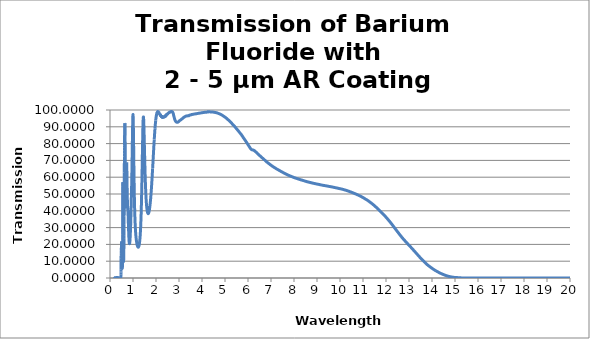
| Category | Series 0 |
|---|---|
| 20.0057 | 0 |
| 19.9979 | 0 |
| 19.9902 | 0 |
| 19.9825 | 0 |
| 19.9748 | 0 |
| 19.9671 | 0 |
| 19.9593 | 0 |
| 19.9516 | 0 |
| 19.943900000000003 | 0 |
| 19.9362 | 0 |
| 19.9284 | 0 |
| 19.9207 | 0 |
| 19.913 | 0 |
| 19.9053 | 0 |
| 19.897599999999997 | 0 |
| 19.8898 | 0 |
| 19.882099999999998 | 0 |
| 19.8744 | 0 |
| 19.8667 | 0 |
| 19.859 | 0 |
| 19.851200000000002 | 0 |
| 19.8435 | 0 |
| 19.8358 | 0 |
| 19.8281 | 0 |
| 19.8203 | 0 |
| 19.8126 | 0 |
| 19.8049 | 0 |
| 19.7972 | 0 |
| 19.7895 | 0 |
| 19.7817 | 0 |
| 19.774 | 0 |
| 19.766299999999998 | 0 |
| 19.758599999999998 | 0 |
| 19.7509 | 0 |
| 19.7431 | 0 |
| 19.735400000000002 | 0 |
| 19.727700000000002 | 0 |
| 19.72 | 0 |
| 19.7123 | 0 |
| 19.7045 | 0 |
| 19.6968 | 0 |
| 19.6891 | 0 |
| 19.6814 | 0 |
| 19.673599999999997 | 0 |
| 19.6659 | 0 |
| 19.6582 | 0 |
| 19.6505 | 0 |
| 19.642799999999998 | 0 |
| 19.635 | 0 |
| 19.627299999999998 | 0 |
| 19.6196 | 0 |
| 19.611900000000002 | 0 |
| 19.604200000000002 | 0 |
| 19.596400000000003 | 0 |
| 19.5887 | 0 |
| 19.581 | 0 |
| 19.5733 | 0 |
| 19.5655 | 0 |
| 19.5578 | 0 |
| 19.550099999999997 | 0 |
| 19.5424 | 0 |
| 19.5347 | 0 |
| 19.5269 | 0 |
| 19.5192 | 0 |
| 19.5115 | 0 |
| 19.5038 | 0 |
| 19.4961 | 0 |
| 19.4883 | 0 |
| 19.4806 | 0 |
| 19.472900000000003 | 0 |
| 19.4652 | 0 |
| 19.4575 | 0 |
| 19.4497 | 0 |
| 19.442 | 0 |
| 19.4343 | 0 |
| 19.426599999999997 | 0 |
| 19.4188 | 0 |
| 19.411099999999998 | 0 |
| 19.4034 | 0 |
| 19.3957 | 0 |
| 19.388 | 0 |
| 19.380200000000002 | 0 |
| 19.3725 | 0 |
| 19.3648 | 0 |
| 19.3571 | 0 |
| 19.349400000000003 | 0 |
| 19.3416 | 0 |
| 19.3339 | 0 |
| 19.3262 | 0 |
| 19.3185 | 0 |
| 19.3107 | 0 |
| 19.303 | 0 |
| 19.2953 | 0 |
| 19.287599999999998 | 0 |
| 19.2799 | 0 |
| 19.2721 | 0 |
| 19.264400000000002 | 0 |
| 19.256700000000002 | 0 |
| 19.249 | 0 |
| 19.2413 | 0 |
| 19.2335 | 0 |
| 19.2258 | 0 |
| 19.2181 | 0 |
| 19.2104 | 0 |
| 19.2027 | 0 |
| 19.1949 | 0 |
| 19.1872 | 0 |
| 19.1795 | 0 |
| 19.171799999999998 | 0 |
| 19.164 | 0 |
| 19.156299999999998 | 0 |
| 19.1486 | 0 |
| 19.140900000000002 | 0 |
| 19.133200000000002 | 0 |
| 19.125400000000003 | 0 |
| 19.1177 | 0 |
| 19.11 | 0 |
| 19.1023 | 0 |
| 19.0946 | 0 |
| 19.0868 | 0 |
| 19.079099999999997 | 0 |
| 19.0714 | 0 |
| 19.0637 | 0 |
| 19.0559 | 0 |
| 19.0482 | 0 |
| 19.0405 | 0 |
| 19.032799999999998 | 0 |
| 19.0251 | 0 |
| 19.0173 | 0 |
| 19.0096 | 0 |
| 19.001900000000003 | 0 |
| 18.9942 | 0 |
| 18.9865 | 0 |
| 18.9787 | 0 |
| 18.971 | 0 |
| 18.9633 | 0 |
| 18.955599999999997 | 0 |
| 18.9479 | 0 |
| 18.940099999999997 | 0 |
| 18.9324 | 0 |
| 18.9247 | 0 |
| 18.917 | 0 |
| 18.909200000000002 | 0 |
| 18.9015 | 0 |
| 18.8938 | 0 |
| 18.8861 | 0 |
| 18.878400000000003 | 0 |
| 18.8706 | 0 |
| 18.8629 | 0 |
| 18.8552 | 0 |
| 18.8475 | 0 |
| 18.8398 | 0 |
| 18.832 | 0 |
| 18.8243 | 0 |
| 18.816599999999998 | 0 |
| 18.8089 | 0 |
| 18.801099999999998 | 0 |
| 18.793400000000002 | 0 |
| 18.785700000000002 | 0 |
| 18.778 | 0 |
| 18.7703 | 0 |
| 18.7625 | 0 |
| 18.7548 | 0 |
| 18.7471 | 0 |
| 18.7394 | 0 |
| 18.7317 | 0 |
| 18.7239 | 0 |
| 18.7162 | 0 |
| 18.7085 | 0 |
| 18.7008 | 0 |
| 18.693099999999998 | 0 |
| 18.685299999999998 | 0 |
| 18.677599999999998 | 0 |
| 18.669900000000002 | 0 |
| 18.662200000000002 | 0 |
| 18.654400000000003 | 0 |
| 18.6467 | 0 |
| 18.639 | 0 |
| 18.6313 | 0 |
| 18.6236 | 0 |
| 18.6158 | 0 |
| 18.6081 | 0 |
| 18.6004 | 0 |
| 18.5927 | 0 |
| 18.585 | 0 |
| 18.5772 | 0 |
| 18.5695 | 0 |
| 18.561799999999998 | 0 |
| 18.5541 | 0 |
| 18.5463 | 0 |
| 18.5386 | 0 |
| 18.530900000000003 | 0 |
| 18.5232 | 0 |
| 18.5155 | 0 |
| 18.5077 | 0 |
| 18.5 | 0 |
| 18.4923 | 0 |
| 18.484599999999997 | 0 |
| 18.4769 | 0 |
| 18.469099999999997 | 0 |
| 18.4614 | 0 |
| 18.4537 | 0 |
| 18.446 | 0 |
| 18.438299999999998 | 0 |
| 18.4305 | 0 |
| 18.4228 | 0 |
| 18.4151 | 0 |
| 18.407400000000003 | 0 |
| 18.3996 | 0 |
| 18.3919 | 0 |
| 18.3842 | 0 |
| 18.3765 | 0 |
| 18.3688 | 0 |
| 18.361 | 0 |
| 18.3533 | 0 |
| 18.345599999999997 | 0 |
| 18.3379 | 0 |
| 18.3302 | 0 |
| 18.322400000000002 | 0 |
| 18.314700000000002 | 0 |
| 18.307 | 0 |
| 18.2993 | 0 |
| 18.2915 | 0 |
| 18.2838 | 0 |
| 18.2761 | 0 |
| 18.2684 | 0 |
| 18.2607 | 0 |
| 18.2529 | 0 |
| 18.2452 | 0 |
| 18.2375 | 0 |
| 18.2298 | 0 |
| 18.222099999999998 | 0 |
| 18.214299999999998 | 0 |
| 18.206599999999998 | 0 |
| 18.198900000000002 | 0 |
| 18.191200000000002 | 0 |
| 18.1835 | 0 |
| 18.1757 | 0 |
| 18.168 | 0 |
| 18.1603 | 0 |
| 18.1526 | 0 |
| 18.1448 | 0 |
| 18.1371 | 0 |
| 18.1294 | 0 |
| 18.1217 | 0 |
| 18.114 | 0 |
| 18.1062 | 0 |
| 18.0985 | 0 |
| 18.090799999999998 | 0 |
| 18.083099999999998 | 0 |
| 18.075400000000002 | 0 |
| 18.0676 | 0 |
| 18.059900000000003 | 0 |
| 18.0522 | 0 |
| 18.0445 | 0 |
| 18.0367 | 0 |
| 18.029 | 0 |
| 18.0213 | 0 |
| 18.0136 | 0 |
| 18.0059 | 0 |
| 17.998099999999997 | 0 |
| 17.9904 | 0 |
| 17.9827 | 0 |
| 17.975 | 0 |
| 17.967299999999998 | 0 |
| 17.9595 | 0 |
| 17.9518 | 0 |
| 17.9441 | 0 |
| 17.936400000000003 | 0 |
| 17.9287 | 0 |
| 17.920900000000003 | 0 |
| 17.9132 | 0 |
| 17.9055 | 0 |
| 17.8978 | 0 |
| 17.89 | 0 |
| 17.8823 | 0 |
| 17.874599999999997 | 0 |
| 17.8669 | 0 |
| 17.8592 | 0 |
| 17.8514 | 0 |
| 17.843700000000002 | 0 |
| 17.836 | 0 |
| 17.8283 | 0 |
| 17.8206 | 0 |
| 17.8128 | 0 |
| 17.8051 | 0 |
| 17.797400000000003 | 0 |
| 17.7897 | 0 |
| 17.7819 | 0 |
| 17.7742 | 0 |
| 17.7665 | 0 |
| 17.7588 | 0 |
| 17.751099999999997 | 0 |
| 17.743299999999998 | 0 |
| 17.735599999999998 | 0 |
| 17.7279 | 0 |
| 17.720200000000002 | 0 |
| 17.7125 | 0 |
| 17.7047 | 0 |
| 17.697 | 0 |
| 17.6893 | 0 |
| 17.6816 | 0 |
| 17.6739 | 0 |
| 17.6661 | 0 |
| 17.6584 | 0 |
| 17.6507 | 0 |
| 17.643 | 0 |
| 17.6352 | 0 |
| 17.6275 | 0 |
| 17.619799999999998 | 0 |
| 17.612099999999998 | 0 |
| 17.604400000000002 | 0 |
| 17.5966 | 0 |
| 17.588900000000002 | 0 |
| 17.5812 | 0 |
| 17.5735 | 0 |
| 17.5658 | 0 |
| 17.558 | 0 |
| 17.5503 | 0 |
| 17.5426 | 0 |
| 17.5349 | 0 |
| 17.527099999999997 | 0 |
| 17.5194 | 0 |
| 17.5117 | 0 |
| 17.504 | 0 |
| 17.496299999999998 | 0 |
| 17.4885 | 0 |
| 17.4808 | 0 |
| 17.4731 | 0 |
| 17.465400000000002 | 0 |
| 17.4577 | 0 |
| 17.449900000000003 | 0 |
| 17.4422 | 0 |
| 17.4345 | 0 |
| 17.4268 | 0 |
| 17.4191 | 0 |
| 17.4113 | 0 |
| 17.403599999999997 | 0 |
| 17.3959 | 0 |
| 17.3882 | 0 |
| 17.3804 | 0 |
| 17.372700000000002 | 0 |
| 17.365 | 0 |
| 17.3573 | 0 |
| 17.3496 | 0 |
| 17.3418 | 0 |
| 17.3341 | 0 |
| 17.326400000000003 | 0 |
| 17.3187 | 0 |
| 17.311 | 0 |
| 17.3032 | 0 |
| 17.2955 | 0 |
| 17.2878 | 0 |
| 17.280099999999997 | 0 |
| 17.2724 | 0 |
| 17.264599999999998 | 0 |
| 17.2569 | 0 |
| 17.249200000000002 | 0 |
| 17.2415 | 0 |
| 17.233700000000002 | 0 |
| 17.226 | 0 |
| 17.2183 | 0 |
| 17.2106 | 0 |
| 17.202900000000003 | 0 |
| 17.1951 | 0 |
| 17.1874 | 0 |
| 17.1797 | 0 |
| 17.172 | 0 |
| 17.1643 | 0 |
| 17.1565 | 0 |
| 17.148799999999998 | 0 |
| 17.141099999999998 | 0 |
| 17.1334 | 0 |
| 17.1256 | 0 |
| 17.117900000000002 | 0 |
| 17.1102 | 0 |
| 17.1025 | 0 |
| 17.0948 | 0 |
| 17.087 | 0 |
| 17.0793 | 0 |
| 17.0716 | 0 |
| 17.0639 | 0 |
| 17.0562 | 0 |
| 17.0484 | 0 |
| 17.0407 | 0 |
| 17.033 | 0 |
| 17.025299999999998 | 0 |
| 17.017599999999998 | 0 |
| 17.0098 | 0 |
| 17.0021 | 0 |
| 16.994400000000002 | 0 |
| 16.9867 | 0 |
| 16.978900000000003 | 0 |
| 16.9712 | 0 |
| 16.9635 | 0 |
| 16.9558 | 0 |
| 16.9481 | 0 |
| 16.9403 | 0 |
| 16.932599999999997 | 0 |
| 16.9249 | 0 |
| 16.9172 | 0 |
| 16.9095 | 0 |
| 16.9017 | 0 |
| 16.894 | 0 |
| 16.8863 | 0 |
| 16.8786 | 0 |
| 16.8708 | 0 |
| 16.8631 | 0 |
| 16.855400000000003 | 0 |
| 16.8477 | 0 |
| 16.84 | 0 |
| 16.8322 | 0 |
| 16.8245 | 0 |
| 16.8168 | 0 |
| 16.809099999999997 | 0 |
| 16.8014 | 0 |
| 16.793599999999998 | 0 |
| 16.7859 | 0 |
| 16.778200000000002 | 0 |
| 16.7705 | 0 |
| 16.7628 | 0 |
| 16.755 | 0 |
| 16.7473 | 0 |
| 16.7396 | 0 |
| 16.731900000000003 | 0 |
| 16.7241 | 0 |
| 16.7164 | 0 |
| 16.7087 | 0 |
| 16.701 | 0 |
| 16.6933 | 0 |
| 16.6855 | 0 |
| 16.677799999999998 | 0 |
| 16.670099999999998 | 0 |
| 16.6624 | 0 |
| 16.654700000000002 | 0 |
| 16.646900000000002 | 0 |
| 16.639200000000002 | 0 |
| 16.6315 | 0 |
| 16.6238 | 0 |
| 16.616 | 0 |
| 16.6083 | 0 |
| 16.6006 | 0 |
| 16.5929 | 0 |
| 16.5852 | 0 |
| 16.5774 | 0 |
| 16.5697 | 0 |
| 16.562 | 0 |
| 16.554299999999998 | 0 |
| 16.546599999999998 | 0 |
| 16.5388 | 0 |
| 16.5311 | 0 |
| 16.523400000000002 | 0 |
| 16.515700000000002 | 0 |
| 16.508 | 0 |
| 16.5002 | 0 |
| 16.4925 | 0 |
| 16.4848 | 0 |
| 16.4771 | 0 |
| 16.4693 | 0 |
| 16.461599999999997 | 0 |
| 16.4539 | 0 |
| 16.4462 | 0 |
| 16.4385 | 0 |
| 16.4307 | 0 |
| 16.423 | 0 |
| 16.4153 | 0 |
| 16.4076 | 0 |
| 16.399900000000002 | 0 |
| 16.3921 | 0 |
| 16.384400000000003 | 0 |
| 16.3767 | 0 |
| 16.369 | 0 |
| 16.3612 | 0 |
| 16.3535 | 0 |
| 16.3458 | 0 |
| 16.3381 | 0 |
| 16.3304 | 0 |
| 16.3226 | 0 |
| 16.314899999999998 | 0 |
| 16.3072 | 0 |
| 16.2995 | 0 |
| 16.2918 | 0 |
| 16.284 | 0 |
| 16.2763 | 0 |
| 16.2686 | 0 |
| 16.2609 | 0 |
| 16.2532 | 0 |
| 16.2454 | 0 |
| 16.2377 | 0 |
| 16.23 | 0 |
| 16.2223 | 0 |
| 16.2145 | 0 |
| 16.206799999999998 | 0 |
| 16.1991 | 0 |
| 16.191399999999998 | 0 |
| 16.1837 | 0 |
| 16.1759 | 0 |
| 16.168200000000002 | 0 |
| 16.1605 | 0 |
| 16.1528 | 0 |
| 16.1451 | 0 |
| 16.1373 | 0 |
| 16.1296 | 0 |
| 16.1219 | 0 |
| 16.1142 | 0 |
| 16.1064 | 0 |
| 16.0987 | 0 |
| 16.091 | 0 |
| 16.083299999999998 | 0 |
| 16.0756 | 0 |
| 16.0678 | 0 |
| 16.060100000000002 | 0 |
| 16.0524 | 0 |
| 16.044700000000002 | 0 |
| 16.037 | 0 |
| 16.0292 | 0 |
| 16.0215 | 0 |
| 16.0138 | 0 |
| 16.0061 | 0 |
| 15.9984 | 0 |
| 15.9906 | 0 |
| 15.982899999999999 | 0 |
| 15.975200000000001 | 0 |
| 15.9675 | 0 |
| 15.959700000000002 | 0 |
| 15.952 | 0 |
| 15.9443 | 0 |
| 15.9366 | 0 |
| 15.9289 | 0 |
| 15.921100000000001 | 0 |
| 15.9134 | 0 |
| 15.905700000000001 | 0 |
| 15.898 | 0 |
| 15.8903 | 0 |
| 15.8825 | 0 |
| 15.874799999999999 | 0 |
| 15.8671 | 0 |
| 15.859399999999999 | 0 |
| 15.851600000000001 | 0 |
| 15.8439 | 0 |
| 15.836200000000002 | 0 |
| 15.8285 | 0 |
| 15.820799999999998 | 0 |
| 15.813 | 0 |
| 15.805299999999999 | 0 |
| 15.797600000000001 | 0 |
| 15.7899 | 0 |
| 15.782200000000001 | 0 |
| 15.7744 | 0 |
| 15.7667 | 0 |
| 15.759 | 0 |
| 15.751299999999999 | 0 |
| 15.7436 | 0 |
| 15.7358 | 0 |
| 15.7281 | 0 |
| 15.7204 | 0 |
| 15.7127 | 0 |
| 15.7049 | 0 |
| 15.6972 | 0 |
| 15.6895 | 0 |
| 15.681799999999999 | 0 |
| 15.674100000000001 | 0 |
| 15.6663 | 0 |
| 15.6586 | 0 |
| 15.6509 | 0 |
| 15.6432 | 0 |
| 15.6355 | 0 |
| 15.6277 | 0 |
| 15.62 | 0 |
| 15.6123 | 0 |
| 15.6046 | 0 |
| 15.5968 | 0 |
| 15.5891 | 0 |
| 15.5814 | 0 |
| 15.5737 | 0 |
| 15.566 | 0 |
| 15.558200000000001 | 0 |
| 15.5505 | 0 |
| 15.5428 | 0 |
| 15.5351 | 0 |
| 15.5274 | 0 |
| 15.5196 | 0 |
| 15.511899999999999 | 0 |
| 15.5042 | 0 |
| 15.4965 | 0 |
| 15.4888 | 0 |
| 15.481 | 0 |
| 15.4733 | 0 |
| 15.4656 | 0 |
| 15.4579 | 0 |
| 15.4501 | 0 |
| 15.4424 | 0 |
| 15.434700000000001 | 0 |
| 15.427 | 0 |
| 15.4193 | 0 |
| 15.4115 | 0 |
| 15.403799999999999 | 0 |
| 15.3961 | 0 |
| 15.388399999999999 | 0 |
| 15.380700000000001 | 0.001 |
| 15.3729 | 0.002 |
| 15.365200000000002 | 0.003 |
| 15.3575 | 0.004 |
| 15.3498 | 0.005 |
| 15.342 | 0.006 |
| 15.334299999999999 | 0.013 |
| 15.326600000000001 | 0.02 |
| 15.3189 | 0.027 |
| 15.311200000000001 | 0.033 |
| 15.3034 | 0.04 |
| 15.2957 | 0.047 |
| 15.288 | 0.054 |
| 15.280299999999999 | 0.061 |
| 15.2726 | 0.067 |
| 15.2648 | 0.074 |
| 15.257100000000001 | 0.081 |
| 15.2494 | 0.088 |
| 15.241700000000002 | 0.095 |
| 15.234 | 0.101 |
| 15.2262 | 0.108 |
| 15.2185 | 0.115 |
| 15.210799999999999 | 0.121 |
| 15.203100000000001 | 0.129 |
| 15.1953 | 0.136 |
| 15.1876 | 0.143 |
| 15.1799 | 0.151 |
| 15.1722 | 0.158 |
| 15.1645 | 0.166 |
| 15.1567 | 0.174 |
| 15.149 | 0.183 |
| 15.1413 | 0.191 |
| 15.1336 | 0.2 |
| 15.1259 | 0.208 |
| 15.1181 | 0.217 |
| 15.1104 | 0.225 |
| 15.1027 | 0.233 |
| 15.095 | 0.241 |
| 15.087200000000001 | 0.249 |
| 15.0795 | 0.257 |
| 15.0718 | 0.264 |
| 15.0641 | 0.27 |
| 15.0564 | 0.277 |
| 15.0486 | 0.283 |
| 15.040899999999999 | 0.289 |
| 15.0332 | 0.296 |
| 15.0255 | 0.302 |
| 15.0178 | 0.31 |
| 15.01 | 0.317 |
| 15.0023 | 0.324 |
| 14.9946 | 0.331 |
| 14.9869 | 0.338 |
| 14.9792 | 0.35 |
| 14.9714 | 0.363 |
| 14.963700000000001 | 0.375 |
| 14.956 | 0.388 |
| 14.9483 | 0.4 |
| 14.9405 | 0.414 |
| 14.932799999999999 | 0.43 |
| 14.9251 | 0.446 |
| 14.917399999999999 | 0.462 |
| 14.9097 | 0.478 |
| 14.9019 | 0.494 |
| 14.894200000000001 | 0.512 |
| 14.8865 | 0.529 |
| 14.8788 | 0.547 |
| 14.8711 | 0.565 |
| 14.863299999999999 | 0.583 |
| 14.8556 | 0.601 |
| 14.8479 | 0.621 |
| 14.840200000000001 | 0.641 |
| 14.8324 | 0.661 |
| 14.8247 | 0.681 |
| 14.817 | 0.701 |
| 14.809299999999999 | 0.723 |
| 14.8016 | 0.745 |
| 14.7938 | 0.767 |
| 14.786100000000001 | 0.789 |
| 14.7784 | 0.811 |
| 14.770700000000001 | 0.834 |
| 14.763 | 0.859 |
| 14.7552 | 0.884 |
| 14.7475 | 0.908 |
| 14.739799999999999 | 0.933 |
| 14.7321 | 0.958 |
| 14.7244 | 0.986 |
| 14.7166 | 1.014 |
| 14.7089 | 1.043 |
| 14.7012 | 1.071 |
| 14.6935 | 1.1 |
| 14.6857 | 1.13 |
| 14.678 | 1.163 |
| 14.6703 | 1.195 |
| 14.662600000000001 | 1.227 |
| 14.6549 | 1.26 |
| 14.6471 | 1.293 |
| 14.6394 | 1.327 |
| 14.6317 | 1.362 |
| 14.624 | 1.397 |
| 14.616299999999999 | 1.432 |
| 14.6085 | 1.467 |
| 14.6008 | 1.504 |
| 14.5931 | 1.541 |
| 14.5854 | 1.579 |
| 14.5776 | 1.616 |
| 14.5699 | 1.654 |
| 14.5622 | 1.693 |
| 14.5545 | 1.734 |
| 14.5468 | 1.775 |
| 14.539 | 1.816 |
| 14.5313 | 1.857 |
| 14.5236 | 1.899 |
| 14.5159 | 1.942 |
| 14.5082 | 1.985 |
| 14.500399999999999 | 2.028 |
| 14.492700000000001 | 2.072 |
| 14.485 | 2.115 |
| 14.4773 | 2.16 |
| 14.4696 | 2.205 |
| 14.461799999999998 | 2.249 |
| 14.4541 | 2.294 |
| 14.446399999999999 | 2.339 |
| 14.4387 | 2.386 |
| 14.4309 | 2.433 |
| 14.423200000000001 | 2.479 |
| 14.4155 | 2.526 |
| 14.4078 | 2.573 |
| 14.4001 | 2.622 |
| 14.392299999999999 | 2.671 |
| 14.3846 | 2.72 |
| 14.3769 | 2.769 |
| 14.369200000000001 | 2.818 |
| 14.3615 | 2.868 |
| 14.3537 | 2.92 |
| 14.346 | 2.972 |
| 14.338299999999998 | 3.024 |
| 14.3306 | 3.076 |
| 14.322799999999999 | 3.129 |
| 14.315100000000001 | 3.184 |
| 14.3074 | 3.24 |
| 14.299700000000001 | 3.296 |
| 14.292 | 3.352 |
| 14.2842 | 3.408 |
| 14.2765 | 3.466 |
| 14.268799999999999 | 3.525 |
| 14.2611 | 3.583 |
| 14.2534 | 3.642 |
| 14.2456 | 3.7 |
| 14.2379 | 3.759 |
| 14.2302 | 3.818 |
| 14.2225 | 3.877 |
| 14.214799999999999 | 3.936 |
| 14.207 | 3.995 |
| 14.1993 | 4.054 |
| 14.191600000000001 | 4.113 |
| 14.1839 | 4.172 |
| 14.1761 | 4.232 |
| 14.1684 | 4.291 |
| 14.1607 | 4.353 |
| 14.153 | 4.416 |
| 14.145299999999999 | 4.479 |
| 14.1375 | 4.541 |
| 14.1298 | 4.604 |
| 14.1221 | 4.671 |
| 14.1144 | 4.738 |
| 14.1067 | 4.806 |
| 14.0989 | 4.873 |
| 14.0912 | 4.941 |
| 14.0835 | 5.012 |
| 14.0758 | 5.082 |
| 14.068 | 5.153 |
| 14.0603 | 5.224 |
| 14.0526 | 5.295 |
| 14.0449 | 5.367 |
| 14.0372 | 5.439 |
| 14.029399999999999 | 5.512 |
| 14.021700000000001 | 5.585 |
| 14.014 | 5.657 |
| 14.0063 | 5.732 |
| 13.9986 | 5.806 |
| 13.9908 | 5.881 |
| 13.9831 | 5.956 |
| 13.9754 | 6.031 |
| 13.9677 | 6.108 |
| 13.96 | 6.185 |
| 13.952200000000001 | 6.263 |
| 13.9445 | 6.34 |
| 13.9368 | 6.418 |
| 13.9291 | 6.498 |
| 13.921299999999999 | 6.578 |
| 13.9136 | 6.658 |
| 13.905899999999999 | 6.738 |
| 13.898200000000001 | 6.818 |
| 13.8905 | 6.899 |
| 13.882700000000002 | 6.98 |
| 13.875 | 7.06 |
| 13.867299999999998 | 7.141 |
| 13.8596 | 7.222 |
| 13.851899999999999 | 7.303 |
| 13.844100000000001 | 7.384 |
| 13.8364 | 7.465 |
| 13.828700000000001 | 7.546 |
| 13.821 | 7.63 |
| 13.8132 | 7.715 |
| 13.8055 | 7.799 |
| 13.797799999999999 | 7.884 |
| 13.7901 | 7.969 |
| 13.782399999999999 | 8.061 |
| 13.7746 | 8.153 |
| 13.7669 | 8.245 |
| 13.7592 | 8.337 |
| 13.7515 | 8.432 |
| 13.743799999999998 | 8.531 |
| 13.736 | 8.63 |
| 13.728299999999999 | 8.729 |
| 13.720600000000001 | 8.828 |
| 13.7129 | 8.93 |
| 13.705200000000001 | 9.034 |
| 13.6974 | 9.138 |
| 13.6897 | 9.242 |
| 13.682 | 9.346 |
| 13.674299999999999 | 9.452 |
| 13.6665 | 9.558 |
| 13.6588 | 9.665 |
| 13.6511 | 9.771 |
| 13.6434 | 9.879 |
| 13.6357 | 9.988 |
| 13.6279 | 10.097 |
| 13.6202 | 10.206 |
| 13.6125 | 10.315 |
| 13.6048 | 10.425 |
| 13.597100000000001 | 10.536 |
| 13.5893 | 10.647 |
| 13.5816 | 10.758 |
| 13.5739 | 10.87 |
| 13.5662 | 10.981 |
| 13.558399999999999 | 11.092 |
| 13.5507 | 11.204 |
| 13.543 | 11.316 |
| 13.5353 | 11.428 |
| 13.5276 | 11.54 |
| 13.5198 | 11.652 |
| 13.5121 | 11.764 |
| 13.5044 | 11.876 |
| 13.4967 | 11.99 |
| 13.489 | 12.103 |
| 13.481200000000001 | 12.216 |
| 13.4735 | 12.33 |
| 13.4658 | 12.444 |
| 13.4581 | 12.56 |
| 13.4504 | 12.676 |
| 13.4426 | 12.792 |
| 13.434899999999999 | 12.908 |
| 13.427200000000001 | 13.025 |
| 13.4195 | 13.143 |
| 13.411700000000002 | 13.261 |
| 13.404 | 13.379 |
| 13.3963 | 13.498 |
| 13.3886 | 13.617 |
| 13.3809 | 13.737 |
| 13.3731 | 13.856 |
| 13.3654 | 13.976 |
| 13.357700000000001 | 14.095 |
| 13.35 | 14.214 |
| 13.3423 | 14.334 |
| 13.3345 | 14.453 |
| 13.326799999999999 | 14.572 |
| 13.3191 | 14.69 |
| 13.311399999999999 | 14.808 |
| 13.303600000000001 | 14.927 |
| 13.2959 | 15.045 |
| 13.288200000000002 | 15.163 |
| 13.2805 | 15.281 |
| 13.2728 | 15.399 |
| 13.265 | 15.517 |
| 13.257299999999999 | 15.635 |
| 13.249600000000001 | 15.754 |
| 13.2419 | 15.873 |
| 13.234200000000001 | 15.992 |
| 13.2264 | 16.111 |
| 13.2187 | 16.231 |
| 13.211 | 16.35 |
| 13.203299999999999 | 16.47 |
| 13.1956 | 16.59 |
| 13.1878 | 16.708 |
| 13.1801 | 16.827 |
| 13.1724 | 16.945 |
| 13.1647 | 17.064 |
| 13.1569 | 17.181 |
| 13.1492 | 17.298 |
| 13.1415 | 17.414 |
| 13.133799999999999 | 17.531 |
| 13.126100000000001 | 17.647 |
| 13.1183 | 17.763 |
| 13.1106 | 17.879 |
| 13.1029 | 17.994 |
| 13.0952 | 18.11 |
| 13.0875 | 18.226 |
| 13.0797 | 18.341 |
| 13.072 | 18.456 |
| 13.0643 | 18.572 |
| 13.0566 | 18.687 |
| 13.0488 | 18.801 |
| 13.0411 | 18.915 |
| 13.0334 | 19.03 |
| 13.0257 | 19.144 |
| 13.018 | 19.257 |
| 13.010200000000001 | 19.371 |
| 13.0025 | 19.484 |
| 12.9948 | 19.598 |
| 12.9871 | 19.711 |
| 12.9794 | 19.824 |
| 12.9716 | 19.938 |
| 12.963899999999999 | 20.051 |
| 12.9562 | 20.163 |
| 12.9485 | 20.275 |
| 12.9408 | 20.387 |
| 12.933 | 20.499 |
| 12.9253 | 20.611 |
| 12.9176 | 20.722 |
| 12.9099 | 20.834 |
| 12.9021 | 20.946 |
| 12.8944 | 21.06 |
| 12.886700000000001 | 21.174 |
| 12.879 | 21.289 |
| 12.8713 | 21.404 |
| 12.8635 | 21.52 |
| 12.855799999999999 | 21.637 |
| 12.8481 | 21.754 |
| 12.840399999999999 | 21.872 |
| 12.8327 | 21.99 |
| 12.8249 | 22.108 |
| 12.817200000000001 | 22.226 |
| 12.8095 | 22.345 |
| 12.8018 | 22.463 |
| 12.794 | 22.582 |
| 12.786299999999999 | 22.7 |
| 12.7786 | 22.818 |
| 12.7709 | 22.937 |
| 12.763200000000001 | 23.056 |
| 12.7554 | 23.176 |
| 12.7477 | 23.296 |
| 12.74 | 23.416 |
| 12.732299999999999 | 23.539 |
| 12.7246 | 23.662 |
| 12.7168 | 23.786 |
| 12.709100000000001 | 23.91 |
| 12.7014 | 24.037 |
| 12.693700000000002 | 24.165 |
| 12.686 | 24.293 |
| 12.6782 | 24.421 |
| 12.6705 | 24.553 |
| 12.662799999999999 | 24.684 |
| 12.655100000000001 | 24.816 |
| 12.6473 | 24.949 |
| 12.6396 | 25.083 |
| 12.6319 | 25.217 |
| 12.6242 | 25.352 |
| 12.6165 | 25.487 |
| 12.6087 | 25.623 |
| 12.601 | 25.758 |
| 12.5933 | 25.894 |
| 12.585600000000001 | 26.03 |
| 12.5779 | 26.167 |
| 12.5701 | 26.303 |
| 12.5624 | 26.44 |
| 12.5547 | 26.576 |
| 12.547 | 26.713 |
| 12.539200000000001 | 26.851 |
| 12.5315 | 26.988 |
| 12.5238 | 27.126 |
| 12.5161 | 27.264 |
| 12.5084 | 27.403 |
| 12.5006 | 27.541 |
| 12.492899999999999 | 27.68 |
| 12.4852 | 27.82 |
| 12.4775 | 27.959 |
| 12.4698 | 28.099 |
| 12.462 | 28.239 |
| 12.4543 | 28.378 |
| 12.4466 | 28.518 |
| 12.4389 | 28.658 |
| 12.4312 | 28.798 |
| 12.423399999999999 | 28.938 |
| 12.415700000000001 | 29.079 |
| 12.408 | 29.219 |
| 12.4003 | 29.359 |
| 12.3925 | 29.499 |
| 12.384799999999998 | 29.639 |
| 12.3771 | 29.779 |
| 12.369399999999999 | 29.918 |
| 12.3617 | 30.056 |
| 12.3539 | 30.195 |
| 12.346200000000001 | 30.334 |
| 12.3385 | 30.472 |
| 12.3308 | 30.61 |
| 12.3231 | 30.748 |
| 12.315299999999999 | 30.886 |
| 12.3076 | 31.026 |
| 12.2999 | 31.167 |
| 12.292200000000001 | 31.307 |
| 12.2844 | 31.448 |
| 12.2767 | 31.589 |
| 12.269 | 31.73 |
| 12.261299999999999 | 31.872 |
| 12.2536 | 32.01 |
| 12.2458 | 32.147 |
| 12.238100000000001 | 32.285 |
| 12.2304 | 32.422 |
| 12.222700000000001 | 32.555 |
| 12.215 | 32.688 |
| 12.2072 | 32.821 |
| 12.1995 | 32.953 |
| 12.191799999999999 | 33.084 |
| 12.1841 | 33.214 |
| 12.1764 | 33.345 |
| 12.1686 | 33.474 |
| 12.1609 | 33.604 |
| 12.1532 | 33.733 |
| 12.1455 | 33.862 |
| 12.1377 | 33.99 |
| 12.13 | 34.118 |
| 12.1223 | 34.247 |
| 12.114600000000001 | 34.375 |
| 12.1069 | 34.502 |
| 12.0991 | 34.629 |
| 12.0914 | 34.757 |
| 12.0837 | 34.883 |
| 12.076 | 35.008 |
| 12.068299999999999 | 35.133 |
| 12.0605 | 35.258 |
| 12.0528 | 35.382 |
| 12.0451 | 35.505 |
| 12.0374 | 35.628 |
| 12.0296 | 35.75 |
| 12.0219 | 35.871 |
| 12.0142 | 35.991 |
| 12.0065 | 36.112 |
| 11.9988 | 36.23 |
| 11.991 | 36.347 |
| 11.9833 | 36.464 |
| 11.9756 | 36.581 |
| 11.9679 | 36.693 |
| 11.9602 | 36.806 |
| 11.952399999999999 | 36.918 |
| 11.944700000000001 | 37.03 |
| 11.937 | 37.14 |
| 11.9293 | 37.25 |
| 11.9216 | 37.36 |
| 11.913799999999998 | 37.469 |
| 11.9061 | 37.578 |
| 11.898399999999999 | 37.687 |
| 11.8907 | 37.795 |
| 11.8829 | 37.903 |
| 11.875200000000001 | 38.011 |
| 11.8675 | 38.119 |
| 11.8598 | 38.226 |
| 11.8521 | 38.332 |
| 11.844299999999999 | 38.438 |
| 11.8366 | 38.544 |
| 11.828899999999999 | 38.648 |
| 11.821200000000001 | 38.753 |
| 11.8135 | 38.858 |
| 11.8057 | 38.963 |
| 11.798 | 39.067 |
| 11.790299999999998 | 39.171 |
| 11.7826 | 39.275 |
| 11.774799999999999 | 39.379 |
| 11.767100000000001 | 39.483 |
| 11.7594 | 39.587 |
| 11.751700000000001 | 39.691 |
| 11.744 | 39.794 |
| 11.7362 | 39.898 |
| 11.7285 | 40.002 |
| 11.720799999999999 | 40.106 |
| 11.7131 | 40.21 |
| 11.7054 | 40.314 |
| 11.6976 | 40.419 |
| 11.6899 | 40.524 |
| 11.6822 | 40.63 |
| 11.6745 | 40.737 |
| 11.666799999999999 | 40.844 |
| 11.659 | 40.951 |
| 11.651299999999999 | 41.058 |
| 11.643600000000001 | 41.164 |
| 11.6359 | 41.271 |
| 11.6281 | 41.378 |
| 11.6204 | 41.481 |
| 11.6127 | 41.584 |
| 11.605 | 41.687 |
| 11.597299999999999 | 41.789 |
| 11.5895 | 41.888 |
| 11.5818 | 41.988 |
| 11.5741 | 42.088 |
| 11.5664 | 42.185 |
| 11.5587 | 42.283 |
| 11.5509 | 42.381 |
| 11.5432 | 42.478 |
| 11.5355 | 42.576 |
| 11.5278 | 42.673 |
| 11.52 | 42.769 |
| 11.5123 | 42.865 |
| 11.5046 | 42.96 |
| 11.4969 | 43.056 |
| 11.4892 | 43.148 |
| 11.481399999999999 | 43.24 |
| 11.473700000000001 | 43.332 |
| 11.466 | 43.42 |
| 11.4583 | 43.508 |
| 11.4506 | 43.597 |
| 11.4428 | 43.684 |
| 11.4351 | 43.77 |
| 11.4274 | 43.856 |
| 11.4197 | 43.943 |
| 11.412 | 44.028 |
| 11.404200000000001 | 44.114 |
| 11.3965 | 44.2 |
| 11.3888 | 44.285 |
| 11.3811 | 44.37 |
| 11.373299999999999 | 44.455 |
| 11.3656 | 44.538 |
| 11.357899999999999 | 44.62 |
| 11.350200000000001 | 44.702 |
| 11.3425 | 44.783 |
| 11.334700000000002 | 44.863 |
| 11.327 | 44.943 |
| 11.3193 | 45.022 |
| 11.3116 | 45.101 |
| 11.3039 | 45.18 |
| 11.296100000000001 | 45.26 |
| 11.2884 | 45.339 |
| 11.280700000000001 | 45.419 |
| 11.273 | 45.499 |
| 11.2652 | 45.577 |
| 11.2575 | 45.655 |
| 11.249799999999999 | 45.734 |
| 11.2421 | 45.809 |
| 11.234399999999999 | 45.884 |
| 11.226600000000001 | 45.959 |
| 11.2189 | 46.031 |
| 11.211200000000002 | 46.102 |
| 11.2035 | 46.172 |
| 11.195799999999998 | 46.242 |
| 11.188 | 46.309 |
| 11.180299999999999 | 46.377 |
| 11.172600000000001 | 46.443 |
| 11.1649 | 46.508 |
| 11.157200000000001 | 46.572 |
| 11.1494 | 46.636 |
| 11.1417 | 46.698 |
| 11.134 | 46.759 |
| 11.126299999999999 | 46.821 |
| 11.1185 | 46.883 |
| 11.1108 | 46.945 |
| 11.1031 | 47.008 |
| 11.0954 | 47.073 |
| 11.0877 | 47.139 |
| 11.0799 | 47.205 |
| 11.0722 | 47.273 |
| 11.0645 | 47.342 |
| 11.056799999999999 | 47.411 |
| 11.049100000000001 | 47.478 |
| 11.0413 | 47.546 |
| 11.0336 | 47.613 |
| 11.0259 | 47.676 |
| 11.0182 | 47.738 |
| 11.010399999999999 | 47.8 |
| 11.0027 | 47.859 |
| 10.995 | 47.918 |
| 10.9873 | 47.976 |
| 10.9796 | 48.034 |
| 10.9718 | 48.092 |
| 10.9641 | 48.151 |
| 10.9564 | 48.21 |
| 10.9487 | 48.27 |
| 10.941 | 48.33 |
| 10.933200000000001 | 48.388 |
| 10.9255 | 48.446 |
| 10.9178 | 48.504 |
| 10.9101 | 48.558 |
| 10.9024 | 48.611 |
| 10.8946 | 48.665 |
| 10.886899999999999 | 48.715 |
| 10.8792 | 48.765 |
| 10.8715 | 48.814 |
| 10.863700000000001 | 48.864 |
| 10.856 | 48.913 |
| 10.8483 | 48.962 |
| 10.8406 | 49.013 |
| 10.8329 | 49.064 |
| 10.8251 | 49.116 |
| 10.8174 | 49.168 |
| 10.809700000000001 | 49.221 |
| 10.802 | 49.274 |
| 10.7943 | 49.326 |
| 10.7865 | 49.378 |
| 10.778799999999999 | 49.429 |
| 10.7711 | 49.478 |
| 10.763399999999999 | 49.528 |
| 10.755600000000001 | 49.576 |
| 10.7479 | 49.624 |
| 10.740200000000002 | 49.671 |
| 10.7325 | 49.717 |
| 10.7248 | 49.763 |
| 10.717 | 49.809 |
| 10.709299999999999 | 49.854 |
| 10.701600000000001 | 49.898 |
| 10.6939 | 49.943 |
| 10.686200000000001 | 49.987 |
| 10.6784 | 50.031 |
| 10.6707 | 50.075 |
| 10.663 | 50.119 |
| 10.655299999999999 | 50.162 |
| 10.6476 | 50.206 |
| 10.6398 | 50.251 |
| 10.632100000000001 | 50.295 |
| 10.6244 | 50.34 |
| 10.616700000000002 | 50.385 |
| 10.6089 | 50.431 |
| 10.6012 | 50.476 |
| 10.5935 | 50.521 |
| 10.585799999999999 | 50.566 |
| 10.578100000000001 | 50.611 |
| 10.5703 | 50.654 |
| 10.5626 | 50.698 |
| 10.5549 | 50.741 |
| 10.5472 | 50.783 |
| 10.5395 | 50.825 |
| 10.5317 | 50.866 |
| 10.524 | 50.906 |
| 10.5163 | 50.947 |
| 10.5086 | 50.988 |
| 10.5008 | 51.028 |
| 10.4931 | 51.068 |
| 10.4854 | 51.108 |
| 10.4777 | 51.149 |
| 10.47 | 51.189 |
| 10.462200000000001 | 51.23 |
| 10.4545 | 51.27 |
| 10.4468 | 51.31 |
| 10.4391 | 51.35 |
| 10.4314 | 51.39 |
| 10.4236 | 51.428 |
| 10.415899999999999 | 51.467 |
| 10.4082 | 51.505 |
| 10.4005 | 51.543 |
| 10.3928 | 51.58 |
| 10.385 | 51.619 |
| 10.3773 | 51.657 |
| 10.3696 | 51.696 |
| 10.3619 | 51.734 |
| 10.3541 | 51.773 |
| 10.3464 | 51.81 |
| 10.338700000000001 | 51.847 |
| 10.331 | 51.884 |
| 10.3233 | 51.92 |
| 10.3155 | 51.955 |
| 10.307799999999999 | 51.991 |
| 10.3001 | 52.026 |
| 10.292399999999999 | 52.061 |
| 10.2847 | 52.096 |
| 10.2769 | 52.13 |
| 10.269200000000001 | 52.165 |
| 10.2615 | 52.198 |
| 10.2538 | 52.232 |
| 10.246 | 52.265 |
| 10.238299999999999 | 52.296 |
| 10.2306 | 52.328 |
| 10.2229 | 52.36 |
| 10.215200000000001 | 52.391 |
| 10.2074 | 52.422 |
| 10.1997 | 52.454 |
| 10.192 | 52.485 |
| 10.184299999999999 | 52.517 |
| 10.1766 | 52.549 |
| 10.1688 | 52.581 |
| 10.161100000000001 | 52.611 |
| 10.1534 | 52.642 |
| 10.145700000000001 | 52.672 |
| 10.138 | 52.702 |
| 10.1302 | 52.732 |
| 10.1225 | 52.762 |
| 10.114799999999999 | 52.791 |
| 10.1071 | 52.821 |
| 10.0993 | 52.85 |
| 10.0916 | 52.878 |
| 10.0839 | 52.905 |
| 10.0762 | 52.93 |
| 10.0685 | 52.956 |
| 10.0607 | 52.979 |
| 10.053 | 53.002 |
| 10.0453 | 53.025 |
| 10.037600000000001 | 53.046 |
| 10.0299 | 53.068 |
| 10.0221 | 53.089 |
| 10.0144 | 53.11 |
| 10.0067 | 53.131 |
| 9.99897 | 53.152 |
| 9.99125 | 53.173 |
| 9.98353 | 53.195 |
| 9.97581 | 53.217 |
| 9.96808 | 53.24 |
| 9.960360000000001 | 53.264 |
| 9.952639999999999 | 53.288 |
| 9.94492 | 53.314 |
| 9.9372 | 53.339 |
| 9.92948 | 53.364 |
| 9.92176 | 53.389 |
| 9.914040000000002 | 53.414 |
| 9.90631 | 53.44 |
| 9.89859 | 53.466 |
| 9.890870000000001 | 53.492 |
| 9.883149999999999 | 53.519 |
| 9.87543 | 53.545 |
| 9.867709999999999 | 53.57 |
| 9.85999 | 53.596 |
| 9.85227 | 53.619 |
| 9.84454 | 53.641 |
| 9.83682 | 53.662 |
| 9.8291 | 53.683 |
| 9.82138 | 53.704 |
| 9.81366 | 53.727 |
| 9.80594 | 53.75 |
| 9.798219999999999 | 53.773 |
| 9.7905 | 53.796 |
| 9.782770000000001 | 53.82 |
| 9.775049999999998 | 53.842 |
| 9.76733 | 53.864 |
| 9.75961 | 53.886 |
| 9.75189 | 53.907 |
| 9.74417 | 53.928 |
| 9.736450000000001 | 53.949 |
| 9.728729999999999 | 53.97 |
| 9.72101 | 53.993 |
| 9.713280000000001 | 54.016 |
| 9.70556 | 54.04 |
| 9.69784 | 54.064 |
| 9.69012 | 54.089 |
| 9.6824 | 54.114 |
| 9.67468 | 54.138 |
| 9.66696 | 54.16 |
| 9.65924 | 54.182 |
| 9.65151 | 54.202 |
| 9.643790000000001 | 54.22 |
| 9.63607 | 54.239 |
| 9.628350000000001 | 54.257 |
| 9.620629999999998 | 54.274 |
| 9.61291 | 54.294 |
| 9.60519 | 54.314 |
| 9.59747 | 54.335 |
| 9.589739999999999 | 54.357 |
| 9.58202 | 54.378 |
| 9.5743 | 54.4 |
| 9.56658 | 54.422 |
| 9.558860000000001 | 54.441 |
| 9.55114 | 54.46 |
| 9.54342 | 54.477 |
| 9.5357 | 54.494 |
| 9.52797 | 54.512 |
| 9.52025 | 54.529 |
| 9.51253 | 54.547 |
| 9.504809999999999 | 54.567 |
| 9.49709 | 54.588 |
| 9.489370000000001 | 54.611 |
| 9.48165 | 54.633 |
| 9.473930000000001 | 54.656 |
| 9.466209999999998 | 54.678 |
| 9.45848 | 54.7 |
| 9.45076 | 54.72 |
| 9.443040000000002 | 54.741 |
| 9.435319999999999 | 54.762 |
| 9.4276 | 54.783 |
| 9.41988 | 54.805 |
| 9.41216 | 54.827 |
| 9.404440000000001 | 54.848 |
| 9.396709999999999 | 54.869 |
| 9.38899 | 54.888 |
| 9.38127 | 54.907 |
| 9.37355 | 54.924 |
| 9.36583 | 54.94 |
| 9.35811 | 54.956 |
| 9.350389999999999 | 54.97 |
| 9.34267 | 54.985 |
| 9.334940000000001 | 55 |
| 9.327219999999999 | 55.016 |
| 9.3195 | 55.034 |
| 9.31178 | 55.052 |
| 9.30406 | 55.072 |
| 9.29634 | 55.092 |
| 9.288620000000002 | 55.113 |
| 9.280899999999999 | 55.134 |
| 9.27317 | 55.155 |
| 9.265450000000001 | 55.175 |
| 9.257729999999999 | 55.195 |
| 9.25001 | 55.216 |
| 9.24229 | 55.237 |
| 9.23457 | 55.259 |
| 9.22685 | 55.282 |
| 9.21913 | 55.304 |
| 9.211409999999999 | 55.326 |
| 9.20368 | 55.348 |
| 9.19596 | 55.37 |
| 9.18824 | 55.39 |
| 9.18052 | 55.41 |
| 9.172799999999999 | 55.429 |
| 9.16508 | 55.447 |
| 9.15736 | 55.466 |
| 9.14964 | 55.484 |
| 9.14191 | 55.504 |
| 9.13419 | 55.527 |
| 9.12647 | 55.55 |
| 9.11875 | 55.577 |
| 9.111030000000001 | 55.603 |
| 9.103309999999999 | 55.629 |
| 9.09559 | 55.654 |
| 9.08787 | 55.677 |
| 9.08014 | 55.699 |
| 9.07242 | 55.72 |
| 9.0647 | 55.742 |
| 9.05698 | 55.764 |
| 9.04926 | 55.787 |
| 9.041540000000001 | 55.811 |
| 9.03382 | 55.834 |
| 9.0261 | 55.856 |
| 9.01837 | 55.878 |
| 9.01065 | 55.898 |
| 9.002930000000001 | 55.918 |
| 8.995209999999998 | 55.938 |
| 8.98749 | 55.959 |
| 8.97977 | 55.979 |
| 8.97205 | 56 |
| 8.96433 | 56.021 |
| 8.956610000000001 | 56.042 |
| 8.948879999999999 | 56.065 |
| 8.94116 | 56.089 |
| 8.933440000000001 | 56.114 |
| 8.92572 | 56.141 |
| 8.918 | 56.166 |
| 8.91028 | 56.191 |
| 8.90256 | 56.214 |
| 8.89484 | 56.237 |
| 8.88711 | 56.258 |
| 8.879389999999999 | 56.279 |
| 8.87167 | 56.3 |
| 8.86395 | 56.321 |
| 8.85623 | 56.342 |
| 8.848510000000001 | 56.364 |
| 8.84079 | 56.387 |
| 8.83307 | 56.412 |
| 8.82534 | 56.438 |
| 8.817620000000002 | 56.464 |
| 8.809899999999999 | 56.49 |
| 8.80218 | 56.517 |
| 8.794459999999999 | 56.544 |
| 8.78674 | 56.57 |
| 8.779020000000001 | 56.597 |
| 8.7713 | 56.624 |
| 8.76357 | 56.652 |
| 8.75585 | 56.678 |
| 8.74813 | 56.703 |
| 8.74041 | 56.727 |
| 8.73269 | 56.75 |
| 8.724969999999999 | 56.774 |
| 8.71725 | 56.799 |
| 8.70953 | 56.825 |
| 8.70181 | 56.852 |
| 8.69408 | 56.88 |
| 8.68636 | 56.909 |
| 8.67864 | 56.938 |
| 8.67092 | 56.967 |
| 8.663200000000002 | 56.994 |
| 8.655479999999999 | 57.022 |
| 8.64776 | 57.046 |
| 8.64004 | 57.071 |
| 8.63231 | 57.095 |
| 8.62459 | 57.12 |
| 8.61687 | 57.146 |
| 8.60915 | 57.173 |
| 8.60143 | 57.2 |
| 8.59371 | 57.227 |
| 8.585989999999999 | 57.255 |
| 8.57827 | 57.284 |
| 8.570540000000001 | 57.314 |
| 8.56282 | 57.346 |
| 8.5551 | 57.379 |
| 8.547379999999999 | 57.411 |
| 8.53966 | 57.443 |
| 8.53194 | 57.474 |
| 8.52422 | 57.505 |
| 8.5165 | 57.536 |
| 8.50878 | 57.566 |
| 8.50105 | 57.597 |
| 8.49333 | 57.627 |
| 8.485610000000001 | 57.657 |
| 8.477889999999999 | 57.689 |
| 8.47017 | 57.722 |
| 8.46245 | 57.758 |
| 8.45473 | 57.794 |
| 8.44701 | 57.831 |
| 8.43928 | 57.867 |
| 8.43156 | 57.903 |
| 8.42384 | 57.937 |
| 8.416120000000001 | 57.97 |
| 8.4084 | 58.001 |
| 8.40068 | 58.032 |
| 8.392959999999999 | 58.064 |
| 8.38524 | 58.095 |
| 8.377510000000001 | 58.126 |
| 8.36979 | 58.155 |
| 8.36207 | 58.185 |
| 8.35435 | 58.216 |
| 8.34663 | 58.247 |
| 8.33891 | 58.28 |
| 8.331190000000001 | 58.312 |
| 8.323469999999999 | 58.344 |
| 8.31574 | 58.374 |
| 8.30802 | 58.403 |
| 8.3003 | 58.431 |
| 8.29258 | 58.459 |
| 8.28486 | 58.488 |
| 8.27714 | 58.52 |
| 8.26942 | 58.552 |
| 8.261700000000001 | 58.587 |
| 8.25398 | 58.623 |
| 8.24625 | 58.66 |
| 8.23853 | 58.698 |
| 8.23081 | 58.736 |
| 8.223090000000001 | 58.772 |
| 8.21537 | 58.808 |
| 8.20765 | 58.842 |
| 8.19993 | 58.876 |
| 8.19221 | 58.908 |
| 8.184479999999999 | 58.943 |
| 8.17676 | 58.978 |
| 8.16904 | 59.015 |
| 8.16132 | 59.052 |
| 8.1536 | 59.089 |
| 8.14588 | 59.127 |
| 8.13816 | 59.165 |
| 8.13044 | 59.203 |
| 8.12271 | 59.24 |
| 8.11499 | 59.277 |
| 8.10727 | 59.313 |
| 8.09955 | 59.349 |
| 8.09183 | 59.386 |
| 8.084109999999999 | 59.422 |
| 8.07639 | 59.457 |
| 8.068670000000001 | 59.493 |
| 8.06094 | 59.528 |
| 8.05322 | 59.565 |
| 8.0455 | 59.602 |
| 8.03778 | 59.639 |
| 8.03006 | 59.675 |
| 8.02234 | 59.71 |
| 8.01462 | 59.745 |
| 8.0069 | 59.782 |
| 7.99918 | 59.82 |
| 7.9914499999999995 | 59.86 |
| 7.9837299999999995 | 59.901 |
| 7.9760100000000005 | 59.944 |
| 7.96829 | 59.986 |
| 7.96057 | 60.029 |
| 7.952850000000001 | 60.07 |
| 7.94513 | 60.111 |
| 7.93741 | 60.151 |
| 7.92968 | 60.19 |
| 7.92196 | 60.23 |
| 7.9142399999999995 | 60.271 |
| 7.90652 | 60.313 |
| 7.8988000000000005 | 60.356 |
| 7.89108 | 60.399 |
| 7.88336 | 60.443 |
| 7.875640000000001 | 60.487 |
| 7.86791 | 60.531 |
| 7.860189999999999 | 60.575 |
| 7.85247 | 60.619 |
| 7.84475 | 60.663 |
| 7.8370299999999995 | 60.708 |
| 7.82931 | 60.753 |
| 7.8215900000000005 | 60.799 |
| 7.81387 | 60.845 |
| 7.80614 | 60.891 |
| 7.79842 | 60.936 |
| 7.7907 | 60.978 |
| 7.782979999999999 | 61.019 |
| 7.77526 | 61.06 |
| 7.76754 | 61.103 |
| 7.7598199999999995 | 61.148 |
| 7.7521 | 61.194 |
| 7.7443800000000005 | 61.24 |
| 7.73665 | 61.287 |
| 7.72893 | 61.334 |
| 7.72121 | 61.383 |
| 7.71349 | 61.433 |
| 7.70577 | 61.486 |
| 7.69805 | 61.539 |
| 7.69033 | 61.592 |
| 7.6826099999999995 | 61.643 |
| 7.67488 | 61.692 |
| 7.66716 | 61.741 |
| 7.65944 | 61.79 |
| 7.65172 | 61.842 |
| 7.644 | 61.894 |
| 7.63628 | 61.948 |
| 7.62856 | 62.001 |
| 7.62084 | 62.055 |
| 7.61311 | 62.11 |
| 7.605390000000001 | 62.164 |
| 7.59767 | 62.218 |
| 7.58995 | 62.274 |
| 7.582229999999999 | 62.331 |
| 7.57451 | 62.39 |
| 7.56679 | 62.45 |
| 7.559069999999999 | 62.511 |
| 7.55134 | 62.572 |
| 7.54362 | 62.633 |
| 7.5359 | 62.693 |
| 7.52818 | 62.751 |
| 7.52046 | 62.808 |
| 7.51274 | 62.866 |
| 7.50502 | 62.926 |
| 7.4973 | 62.99 |
| 7.48958 | 63.054 |
| 7.4818500000000006 | 63.118 |
| 7.47413 | 63.175 |
| 7.46641 | 63.228 |
| 7.45869 | 63.28 |
| 7.45097 | 63.332 |
| 7.44325 | 63.387 |
| 7.43553 | 63.444 |
| 7.42781 | 63.503 |
| 7.42008 | 63.562 |
| 7.41236 | 63.623 |
| 7.4046400000000006 | 63.686 |
| 7.39692 | 63.75 |
| 7.3892 | 63.814 |
| 7.38148 | 63.875 |
| 7.37376 | 63.935 |
| 7.36604 | 63.992 |
| 7.35831 | 64.05 |
| 7.35059 | 64.11 |
| 7.34287 | 64.172 |
| 7.33515 | 64.233 |
| 7.3274300000000006 | 64.291 |
| 7.31971 | 64.346 |
| 7.31199 | 64.4 |
| 7.304270000000001 | 64.452 |
| 7.29654 | 64.506 |
| 7.288819999999999 | 64.563 |
| 7.2811 | 64.624 |
| 7.27338 | 64.689 |
| 7.26566 | 64.753 |
| 7.25794 | 64.816 |
| 7.2502200000000006 | 64.877 |
| 7.2425 | 64.937 |
| 7.23478 | 64.998 |
| 7.22705 | 65.062 |
| 7.21933 | 65.131 |
| 7.211609999999999 | 65.202 |
| 7.20389 | 65.274 |
| 7.19617 | 65.341 |
| 7.18845 | 65.407 |
| 7.18073 | 65.474 |
| 7.1730100000000006 | 65.546 |
| 7.16528 | 65.617 |
| 7.15756 | 65.684 |
| 7.14984 | 65.747 |
| 7.14212 | 65.809 |
| 7.134399999999999 | 65.871 |
| 7.12668 | 65.934 |
| 7.11896 | 65.999 |
| 7.11124 | 66.068 |
| 7.10351 | 66.142 |
| 7.09579 | 66.22 |
| 7.08807 | 66.298 |
| 7.08035 | 66.374 |
| 7.07263 | 66.448 |
| 7.06491 | 66.522 |
| 7.057189999999999 | 66.595 |
| 7.04947 | 66.664 |
| 7.04174 | 66.734 |
| 7.034020000000001 | 66.805 |
| 7.0263 | 66.882 |
| 7.01858 | 66.964 |
| 7.01086 | 67.045 |
| 7.00314 | 67.126 |
| 6.99542 | 67.206 |
| 6.9877 | 67.282 |
| 6.979979999999999 | 67.35 |
| 6.97225 | 67.418 |
| 6.96453 | 67.493 |
| 6.956810000000001 | 67.578 |
| 6.94909 | 67.669 |
| 6.94137 | 67.757 |
| 6.933649999999999 | 67.839 |
| 6.92593 | 67.917 |
| 6.91821 | 67.994 |
| 6.91048 | 68.071 |
| 6.90276 | 68.147 |
| 6.89504 | 68.222 |
| 6.88732 | 68.298 |
| 6.8796 | 68.377 |
| 6.87188 | 68.459 |
| 6.86416 | 68.544 |
| 6.856439999999999 | 68.628 |
| 6.84871 | 68.709 |
| 6.84099 | 68.788 |
| 6.833270000000001 | 68.875 |
| 6.82555 | 68.966 |
| 6.81783 | 69.055 |
| 6.81011 | 69.142 |
| 6.80239 | 69.232 |
| 6.79467 | 69.328 |
| 6.7869399999999995 | 69.432 |
| 6.7792200000000005 | 69.535 |
| 6.7715 | 69.633 |
| 6.76378 | 69.73 |
| 6.756060000000001 | 69.826 |
| 6.74834 | 69.922 |
| 6.74062 | 70.018 |
| 6.7329 | 70.114 |
| 6.72518 | 70.212 |
| 6.7174499999999995 | 70.309 |
| 6.7097299999999995 | 70.401 |
| 6.7020100000000005 | 70.487 |
| 6.69429 | 70.571 |
| 6.68657 | 70.659 |
| 6.678850000000001 | 70.754 |
| 6.67113 | 70.854 |
| 6.66341 | 70.952 |
| 6.65568 | 71.046 |
| 6.64796 | 71.138 |
| 6.6402399999999995 | 71.237 |
| 6.63252 | 71.339 |
| 6.6248000000000005 | 71.435 |
| 6.61708 | 71.527 |
| 6.60936 | 71.62 |
| 6.601640000000001 | 71.716 |
| 6.59391 | 71.814 |
| 6.586189999999999 | 71.91 |
| 6.57847 | 72.005 |
| 6.57075 | 72.103 |
| 6.5630299999999995 | 72.2 |
| 6.55531 | 72.292 |
| 6.5475900000000005 | 72.382 |
| 6.53987 | 72.474 |
| 6.53214 | 72.57 |
| 6.52442 | 72.667 |
| 6.5167 | 72.76 |
| 6.508979999999999 | 72.853 |
| 6.50126 | 72.955 |
| 6.49354 | 73.064 |
| 6.4858199999999995 | 73.162 |
| 6.4781 | 73.246 |
| 6.4703800000000005 | 73.324 |
| 6.46265 | 73.406 |
| 6.45493 | 73.496 |
| 6.44721 | 73.594 |
| 6.43949 | 73.698 |
| 6.43177 | 73.807 |
| 6.42405 | 73.916 |
| 6.41633 | 74.016 |
| 6.4086099999999995 | 74.106 |
| 6.40088 | 74.2 |
| 6.39316 | 74.305 |
| 6.38544 | 74.417 |
| 6.37772 | 74.529 |
| 6.37 | 74.64 |
| 6.36228 | 74.747 |
| 6.35456 | 74.853 |
| 6.34684 | 74.961 |
| 6.33911 | 75.06 |
| 6.331390000000001 | 75.151 |
| 6.32367 | 75.244 |
| 6.31595 | 75.34 |
| 6.30823 | 75.435 |
| 6.30051 | 75.526 |
| 6.29279 | 75.616 |
| 6.285069999999999 | 75.702 |
| 6.277340000000001 | 75.782 |
| 6.26962 | 75.856 |
| 6.2619 | 75.924 |
| 6.25418 | 75.987 |
| 6.24646 | 76.046 |
| 6.23874 | 76.098 |
| 6.23102 | 76.141 |
| 6.2233 | 76.173 |
| 6.21558 | 76.194 |
| 6.2078500000000005 | 76.21 |
| 6.20013 | 76.234 |
| 6.19241 | 76.255 |
| 6.18469 | 76.267 |
| 6.17697 | 76.289 |
| 6.16925 | 76.334 |
| 6.16153 | 76.389 |
| 6.15381 | 76.45 |
| 6.1460799999999995 | 76.523 |
| 6.13836 | 76.611 |
| 6.1306400000000005 | 76.714 |
| 6.12292 | 76.838 |
| 6.1152 | 76.983 |
| 6.10748 | 77.124 |
| 6.09976 | 77.258 |
| 6.09204 | 77.404 |
| 6.08431 | 77.569 |
| 6.07659 | 77.752 |
| 6.0688699999999995 | 77.933 |
| 6.06115 | 78.093 |
| 6.0534300000000005 | 78.254 |
| 6.04571 | 78.422 |
| 6.03799 | 78.573 |
| 6.030270000000001 | 78.72 |
| 6.02254 | 78.882 |
| 6.014819999999999 | 79.057 |
| 6.0071 | 79.227 |
| 5.99938 | 79.397 |
| 5.9916599999999995 | 79.57 |
| 5.98394 | 79.736 |
| 5.9762200000000005 | 79.892 |
| 5.9685 | 80.051 |
| 5.96078 | 80.217 |
| 5.95305 | 80.39 |
| 5.94533 | 80.573 |
| 5.937609999999999 | 80.749 |
| 5.92989 | 80.903 |
| 5.92217 | 81.049 |
| 5.9144499999999995 | 81.202 |
| 5.90673 | 81.361 |
| 5.8990100000000005 | 81.536 |
| 5.89128 | 81.709 |
| 5.88356 | 81.859 |
| 5.87584 | 82.003 |
| 5.86812 | 82.152 |
| 5.860399999999999 | 82.299 |
| 5.85268 | 82.439 |
| 5.84496 | 82.588 |
| 5.8372399999999995 | 82.753 |
| 5.82951 | 82.917 |
| 5.82179 | 83.056 |
| 5.81407 | 83.181 |
| 5.80635 | 83.323 |
| 5.79863 | 83.481 |
| 5.79091 | 83.649 |
| 5.783189999999999 | 83.827 |
| 5.77547 | 84.006 |
| 5.76774 | 84.173 |
| 5.760020000000001 | 84.325 |
| 5.7523 | 84.479 |
| 5.74458 | 84.64 |
| 5.73686 | 84.805 |
| 5.72914 | 84.974 |
| 5.72142 | 85.134 |
| 5.7137 | 85.261 |
| 5.705979999999999 | 85.373 |
| 5.69825 | 85.505 |
| 5.69053 | 85.651 |
| 5.682810000000001 | 85.79 |
| 5.67509 | 85.921 |
| 5.66737 | 86.051 |
| 5.65965 | 86.195 |
| 5.65193 | 86.346 |
| 5.64421 | 86.478 |
| 5.63648 | 86.588 |
| 5.628760000000001 | 86.709 |
| 5.62104 | 86.844 |
| 5.61332 | 86.976 |
| 5.605600000000001 | 87.1 |
| 5.59788 | 87.231 |
| 5.59016 | 87.375 |
| 5.582439999999999 | 87.518 |
| 5.57471 | 87.642 |
| 5.56699 | 87.767 |
| 5.559270000000001 | 87.899 |
| 5.55155 | 88.026 |
| 5.54383 | 88.148 |
| 5.53611 | 88.275 |
| 5.52839 | 88.406 |
| 5.52067 | 88.532 |
| 5.5129399999999995 | 88.655 |
| 5.5052200000000004 | 88.782 |
| 5.4975 | 88.912 |
| 5.48978 | 89.048 |
| 5.482060000000001 | 89.186 |
| 5.47434 | 89.319 |
| 5.46662 | 89.439 |
| 5.4589 | 89.544 |
| 5.45118 | 89.66 |
| 5.4434499999999995 | 89.788 |
| 5.4357299999999995 | 89.92 |
| 5.4280100000000004 | 90.054 |
| 5.42029 | 90.169 |
| 5.41257 | 90.27 |
| 5.404850000000001 | 90.38 |
| 5.39713 | 90.497 |
| 5.38941 | 90.617 |
| 5.38168 | 90.736 |
| 5.37396 | 90.852 |
| 5.3662399999999995 | 90.979 |
| 5.35852 | 91.116 |
| 5.3508000000000004 | 91.229 |
| 5.34308 | 91.32 |
| 5.33536 | 91.425 |
| 5.327640000000001 | 91.54 |
| 5.31991 | 91.655 |
| 5.312189999999999 | 91.769 |
| 5.30447 | 91.89 |
| 5.29675 | 92.013 |
| 5.2890299999999995 | 92.125 |
| 5.28131 | 92.235 |
| 5.27359 | 92.341 |
| 5.26587 | 92.447 |
| 5.25814 | 92.563 |
| 5.25042 | 92.681 |
| 5.2427 | 92.796 |
| 5.234979999999999 | 92.895 |
| 5.22726 | 92.998 |
| 5.21954 | 93.118 |
| 5.2118199999999995 | 93.227 |
| 5.2041 | 93.328 |
| 5.19638 | 93.419 |
| 5.18865 | 93.507 |
| 5.18093 | 93.604 |
| 5.17321 | 93.703 |
| 5.16549 | 93.806 |
| 5.15777 | 93.92 |
| 5.15005 | 94.027 |
| 5.14233 | 94.108 |
| 5.1346099999999995 | 94.189 |
| 5.12688 | 94.28 |
| 5.11916 | 94.376 |
| 5.11144 | 94.472 |
| 5.10372 | 94.566 |
| 5.096 | 94.665 |
| 5.08828 | 94.762 |
| 5.08056 | 94.844 |
| 5.07284 | 94.93 |
| 5.06511 | 95.028 |
| 5.057390000000001 | 95.123 |
| 5.04967 | 95.212 |
| 5.04195 | 95.3 |
| 5.03423 | 95.393 |
| 5.02651 | 95.486 |
| 5.01879 | 95.562 |
| 5.01107 | 95.634 |
| 5.00335 | 95.716 |
| 4.99562 | 95.795 |
| 4.9879 | 95.868 |
| 4.980180000000001 | 95.942 |
| 4.97246 | 96.019 |
| 4.96474 | 96.095 |
| 4.957020000000001 | 96.164 |
| 4.9493 | 96.232 |
| 4.94158 | 96.304 |
| 4.9338500000000005 | 96.372 |
| 4.92613 | 96.438 |
| 4.91841 | 96.509 |
| 4.91069 | 96.581 |
| 4.90297 | 96.653 |
| 4.89525 | 96.72 |
| 4.88753 | 96.789 |
| 4.87981 | 96.859 |
| 4.8720799999999995 | 96.924 |
| 4.86436 | 96.987 |
| 4.8566400000000005 | 97.049 |
| 4.84892 | 97.11 |
| 4.8412 | 97.173 |
| 4.83348 | 97.235 |
| 4.82576 | 97.292 |
| 4.81804 | 97.342 |
| 4.81031 | 97.396 |
| 4.80259 | 97.448 |
| 4.7948699999999995 | 97.498 |
| 4.78715 | 97.55 |
| 4.7794300000000005 | 97.597 |
| 4.77171 | 97.638 |
| 4.76399 | 97.68 |
| 4.756270000000001 | 97.722 |
| 4.74855 | 97.772 |
| 4.740819999999999 | 97.818 |
| 4.7331 | 97.859 |
| 4.72538 | 97.9 |
| 4.7176599999999995 | 97.944 |
| 4.70994 | 97.985 |
| 4.7022200000000005 | 98.03 |
| 4.6945 | 98.076 |
| 4.68678 | 98.115 |
| 4.67905 | 98.151 |
| 4.67133 | 98.19 |
| 4.663609999999999 | 98.233 |
| 4.65589 | 98.268 |
| 4.64817 | 98.298 |
| 4.6404499999999995 | 98.327 |
| 4.63273 | 98.356 |
| 4.6250100000000005 | 98.383 |
| 4.61728 | 98.412 |
| 4.60956 | 98.434 |
| 4.60184 | 98.457 |
| 4.59412 | 98.48 |
| 4.586399999999999 | 98.499 |
| 4.57868 | 98.517 |
| 4.57096 | 98.539 |
| 4.5632399999999995 | 98.558 |
| 4.55551 | 98.577 |
| 4.54779 | 98.597 |
| 4.54007 | 98.622 |
| 4.53235 | 98.646 |
| 4.52463 | 98.663 |
| 4.51691 | 98.682 |
| 4.509189999999999 | 98.705 |
| 4.50147 | 98.721 |
| 4.49375 | 98.736 |
| 4.486020000000001 | 98.753 |
| 4.4783 | 98.76 |
| 4.47058 | 98.773 |
| 4.46286 | 98.779 |
| 4.45514 | 98.783 |
| 4.44742 | 98.79 |
| 4.4397 | 98.799 |
| 4.431979999999999 | 98.805 |
| 4.42425 | 98.808 |
| 4.41653 | 98.811 |
| 4.408810000000001 | 98.81 |
| 4.40109 | 98.817 |
| 4.39337 | 98.818 |
| 4.38565 | 98.814 |
| 4.37793 | 98.827 |
| 4.37021 | 98.843 |
| 4.36248 | 98.862 |
| 4.354760000000001 | 98.874 |
| 4.34704 | 98.891 |
| 4.33932 | 98.917 |
| 4.331600000000001 | 98.927 |
| 4.32388 | 98.924 |
| 4.31616 | 98.94 |
| 4.308439999999999 | 98.949 |
| 4.3007100000000005 | 98.932 |
| 4.29299 | 98.902 |
| 4.285270000000001 | 98.883 |
| 4.27755 | 98.867 |
| 4.26983 | 98.844 |
| 4.26211 | 98.837 |
| 4.25439 | 98.951 |
| 4.24667 | 98.965 |
| 4.23895 | 98.858 |
| 4.23122 | 98.797 |
| 4.2235 | 98.756 |
| 4.21578 | 98.737 |
| 4.208060000000001 | 98.727 |
| 4.20034 | 98.73 |
| 4.19262 | 98.729 |
| 4.1849 | 98.73 |
| 4.17718 | 98.715 |
| 4.169449999999999 | 98.695 |
| 4.1617299999999995 | 98.68 |
| 4.15401 | 98.656 |
| 4.14629 | 98.641 |
| 4.13857 | 98.633 |
| 4.130850000000001 | 98.625 |
| 4.12313 | 98.614 |
| 4.11541 | 98.603 |
| 4.10768 | 98.589 |
| 4.09996 | 98.575 |
| 4.092239999999999 | 98.567 |
| 4.08452 | 98.559 |
| 4.0768 | 98.547 |
| 4.06908 | 98.535 |
| 4.0613600000000005 | 98.516 |
| 4.05364 | 98.5 |
| 4.04591 | 98.489 |
| 4.03819 | 98.471 |
| 4.03047 | 98.454 |
| 4.02275 | 98.434 |
| 4.01503 | 98.416 |
| 4.00731 | 98.398 |
| 3.99959 | 98.378 |
| 3.99187 | 98.365 |
| 3.98415 | 98.339 |
| 3.97642 | 98.322 |
| 3.9686999999999997 | 98.305 |
| 3.96098 | 98.29 |
| 3.95326 | 98.276 |
| 3.94554 | 98.261 |
| 3.9378200000000003 | 98.24 |
| 3.9301 | 98.222 |
| 3.92238 | 98.203 |
| 3.91465 | 98.179 |
| 3.90693 | 98.159 |
| 3.89921 | 98.142 |
| 3.8914899999999997 | 98.124 |
| 3.88377 | 98.1 |
| 3.87605 | 98.08 |
| 3.86833 | 98.063 |
| 3.8606100000000003 | 98.044 |
| 3.8528800000000003 | 98.029 |
| 3.84516 | 98.015 |
| 3.83744 | 97.991 |
| 3.82972 | 97.979 |
| 3.822 | 97.957 |
| 3.81428 | 97.934 |
| 3.80656 | 97.918 |
| 3.79884 | 97.902 |
| 3.79111 | 97.88 |
| 3.78339 | 97.859 |
| 3.77567 | 97.844 |
| 3.76795 | 97.823 |
| 3.76023 | 97.804 |
| 3.75251 | 97.791 |
| 3.74479 | 97.766 |
| 3.73707 | 97.746 |
| 3.7293499999999997 | 97.725 |
| 3.7216199999999997 | 97.717 |
| 3.7139 | 97.69 |
| 3.70618 | 97.677 |
| 3.69846 | 97.653 |
| 3.69074 | 97.632 |
| 3.68302 | 97.623 |
| 3.6753 | 97.599 |
| 3.66758 | 97.577 |
| 3.65985 | 97.56 |
| 3.65213 | 97.56 |
| 3.6444099999999997 | 97.535 |
| 3.63669 | 97.51 |
| 3.62897 | 97.496 |
| 3.62125 | 97.47 |
| 3.6135300000000004 | 97.452 |
| 3.60581 | 97.422 |
| 3.59808 | 97.414 |
| 3.59036 | 97.399 |
| 3.58264 | 97.377 |
| 3.57492 | 97.363 |
| 3.5671999999999997 | 97.357 |
| 3.55948 | 97.327 |
| 3.5517600000000003 | 97.303 |
| 3.54404 | 97.278 |
| 3.53631 | 97.246 |
| 3.5285900000000003 | 97.198 |
| 3.52087 | 97.153 |
| 3.51315 | 97.081 |
| 3.50543 | 96.994 |
| 3.49771 | 96.976 |
| 3.4899899999999997 | 96.989 |
| 3.48227 | 96.967 |
| 3.4745500000000002 | 96.971 |
| 3.4668200000000002 | 96.96 |
| 3.4591 | 96.923 |
| 3.45138 | 96.866 |
| 3.44366 | 96.819 |
| 3.43594 | 96.742 |
| 3.4282199999999996 | 96.638 |
| 3.4205 | 96.534 |
| 3.41278 | 96.505 |
| 3.40505 | 96.561 |
| 3.3973299999999997 | 96.581 |
| 3.3896100000000002 | 96.586 |
| 3.38189 | 96.549 |
| 3.37417 | 96.523 |
| 3.36645 | 96.508 |
| 3.35873 | 96.475 |
| 3.35101 | 96.492 |
| 3.34328 | 96.498 |
| 3.33556 | 96.502 |
| 3.32784 | 96.499 |
| 3.3201199999999997 | 96.453 |
| 3.3124000000000002 | 96.414 |
| 3.30468 | 96.376 |
| 3.29696 | 96.331 |
| 3.28924 | 96.281 |
| 3.2815100000000004 | 96.226 |
| 3.27379 | 96.171 |
| 3.26607 | 96.119 |
| 3.25835 | 96.038 |
| 3.25063 | 95.967 |
| 3.2429099999999997 | 95.9 |
| 3.2351900000000002 | 95.859 |
| 3.22747 | 95.788 |
| 3.21975 | 95.718 |
| 3.21202 | 95.645 |
| 3.2043000000000004 | 95.562 |
| 3.19658 | 95.491 |
| 3.18886 | 95.4 |
| 3.18114 | 95.326 |
| 3.17342 | 95.227 |
| 3.1656999999999997 | 95.145 |
| 3.1579800000000002 | 95.062 |
| 3.15025 | 94.974 |
| 3.1425300000000003 | 94.876 |
| 3.13481 | 94.768 |
| 3.12709 | 94.678 |
| 3.11937 | 94.578 |
| 3.11165 | 94.487 |
| 3.1039299999999996 | 94.394 |
| 3.09621 | 94.307 |
| 3.08848 | 94.242 |
| 3.08076 | 94.165 |
| 3.0730399999999998 | 94.102 |
| 3.0653200000000003 | 94.037 |
| 3.0576 | 93.945 |
| 3.04988 | 93.884 |
| 3.04216 | 93.805 |
| 3.03444 | 93.712 |
| 3.02671 | 93.615 |
| 3.0189899999999996 | 93.55 |
| 3.01127 | 93.46 |
| 3.00355 | 93.375 |
| 2.9958299999999998 | 93.252 |
| 2.9881100000000003 | 93.169 |
| 2.98039 | 93.081 |
| 2.97267 | 92.986 |
| 2.96495 | 92.907 |
| 2.95722 | 92.842 |
| 2.9495 | 92.766 |
| 2.94178 | 92.71 |
| 2.93406 | 92.69 |
| 2.92634 | 92.696 |
| 2.9186199999999998 | 92.676 |
| 2.9109000000000003 | 92.674 |
| 2.90318 | 92.749 |
| 2.89545 | 92.783 |
| 2.88773 | 92.826 |
| 2.8800100000000004 | 92.901 |
| 2.87229 | 93.004 |
| 2.86457 | 93.091 |
| 2.85685 | 93.236 |
| 2.84913 | 93.379 |
| 2.8414099999999998 | 93.566 |
| 2.8336799999999998 | 93.791 |
| 2.8259600000000002 | 94.02 |
| 2.81824 | 94.32 |
| 2.81052 | 94.636 |
| 2.8028000000000004 | 95.006 |
| 2.79508 | 95.345 |
| 2.78736 | 95.797 |
| 2.7796399999999997 | 96.182 |
| 2.7719099999999997 | 96.589 |
| 2.76419 | 96.997 |
| 2.7564699999999998 | 97.618 |
| 2.74875 | 97.862 |
| 2.7410300000000003 | 98.333 |
| 2.73331 | 98.347 |
| 2.72559 | 98.719 |
| 2.71787 | 98.663 |
| 2.71015 | 98.86 |
| 2.70242 | 98.933 |
| 2.6946999999999997 | 99.056 |
| 2.68698 | 99.096 |
| 2.67926 | 99.217 |
| 2.67154 | 99.203 |
| 2.6638200000000003 | 99.014 |
| 2.6561 | 98.993 |
| 2.64838 | 98.949 |
| 2.64065 | 98.876 |
| 2.63293 | 99.004 |
| 2.62521 | 98.808 |
| 2.6174899999999997 | 98.868 |
| 2.60977 | 98.833 |
| 2.60205 | 98.672 |
| 2.59433 | 98.633 |
| 2.5866100000000003 | 98.675 |
| 2.5788800000000003 | 98.563 |
| 2.57116 | 98.465 |
| 2.56344 | 98.474 |
| 2.55572 | 98.289 |
| 2.548 | 98.214 |
| 2.54028 | 98.096 |
| 2.53256 | 98.032 |
| 2.52484 | 97.924 |
| 2.51711 | 97.829 |
| 2.50939 | 97.721 |
| 2.5016700000000003 | 97.632 |
| 2.5 | 97.618 |
| 2.499 | 97.864 |
| 2.498 | 97.865 |
| 2.497 | 97.708 |
| 2.496 | 97.466 |
| 2.495 | 97.627 |
| 2.494 | 97.439 |
| 2.493 | 97.581 |
| 2.492 | 97.525 |
| 2.491 | 97.482 |
| 2.49 | 97.707 |
| 2.489 | 97.606 |
| 2.488 | 97.507 |
| 2.487 | 97.734 |
| 2.486 | 97.613 |
| 2.485 | 97.51 |
| 2.484 | 97.501 |
| 2.483 | 97.461 |
| 2.482 | 97.521 |
| 2.481 | 97.291 |
| 2.48 | 97.467 |
| 2.479 | 97.343 |
| 2.478 | 97.398 |
| 2.477 | 97.429 |
| 2.476 | 97.274 |
| 2.475 | 97.33 |
| 2.474 | 97.32 |
| 2.473 | 97.291 |
| 2.472 | 97.262 |
| 2.471 | 97.23 |
| 2.47 | 97.232 |
| 2.469 | 97.288 |
| 2.468 | 97.332 |
| 2.467 | 97.238 |
| 2.466 | 97.265 |
| 2.465 | 97.232 |
| 2.464 | 97.113 |
| 2.463 | 97.242 |
| 2.462 | 97.167 |
| 2.461 | 97.175 |
| 2.46 | 97.088 |
| 2.459 | 97.112 |
| 2.458 | 97.053 |
| 2.457 | 97.076 |
| 2.456 | 97.107 |
| 2.455 | 97.005 |
| 2.454 | 97.055 |
| 2.453 | 97.085 |
| 2.452 | 97.066 |
| 2.451 | 97.003 |
| 2.45 | 97.013 |
| 2.449 | 96.994 |
| 2.448 | 96.949 |
| 2.447 | 97.014 |
| 2.446 | 96.933 |
| 2.445 | 96.87 |
| 2.444 | 96.944 |
| 2.443 | 96.924 |
| 2.442 | 96.834 |
| 2.441 | 96.99 |
| 2.44 | 96.777 |
| 2.439 | 96.804 |
| 2.438 | 96.75 |
| 2.437 | 96.823 |
| 2.436 | 96.842 |
| 2.435 | 96.74 |
| 2.434 | 96.714 |
| 2.433 | 96.747 |
| 2.432 | 96.638 |
| 2.431 | 96.777 |
| 2.43 | 96.709 |
| 2.429 | 96.717 |
| 2.428 | 96.668 |
| 2.427 | 96.693 |
| 2.426 | 96.657 |
| 2.425 | 96.643 |
| 2.424 | 96.541 |
| 2.423 | 96.631 |
| 2.422 | 96.723 |
| 2.421 | 96.592 |
| 2.42 | 96.517 |
| 2.419 | 96.573 |
| 2.418 | 96.606 |
| 2.417 | 96.582 |
| 2.416 | 96.539 |
| 2.415 | 96.545 |
| 2.414 | 96.424 |
| 2.413 | 96.576 |
| 2.412 | 96.416 |
| 2.411 | 96.591 |
| 2.41 | 96.555 |
| 2.409 | 96.461 |
| 2.408 | 96.453 |
| 2.407 | 96.363 |
| 2.406 | 96.357 |
| 2.405 | 96.341 |
| 2.404 | 96.282 |
| 2.403 | 96.371 |
| 2.402 | 96.439 |
| 2.401 | 96.313 |
| 2.4 | 96.349 |
| 2.399 | 96.314 |
| 2.398 | 96.286 |
| 2.397 | 96.384 |
| 2.396 | 96.31 |
| 2.395 | 96.249 |
| 2.394 | 96.305 |
| 2.393 | 96.232 |
| 2.392 | 96.31 |
| 2.391 | 96.269 |
| 2.39 | 96.2 |
| 2.389 | 96.184 |
| 2.388 | 96.164 |
| 2.387 | 96.181 |
| 2.386 | 96.133 |
| 2.385 | 96.136 |
| 2.384 | 96.202 |
| 2.383 | 96.174 |
| 2.382 | 96.147 |
| 2.381 | 96.144 |
| 2.38 | 96.097 |
| 2.379 | 96.131 |
| 2.378 | 96.084 |
| 2.377 | 96.065 |
| 2.376 | 96.03 |
| 2.375 | 95.981 |
| 2.374 | 96.098 |
| 2.373 | 96.09 |
| 2.372 | 95.997 |
| 2.371 | 96.052 |
| 2.37 | 96.026 |
| 2.369 | 96 |
| 2.368 | 95.948 |
| 2.367 | 95.963 |
| 2.366 | 95.987 |
| 2.365 | 96.014 |
| 2.364 | 95.971 |
| 2.363 | 95.963 |
| 2.362 | 95.982 |
| 2.361 | 95.942 |
| 2.36 | 95.969 |
| 2.359 | 95.897 |
| 2.358 | 95.905 |
| 2.357 | 95.896 |
| 2.356 | 95.858 |
| 2.355 | 95.892 |
| 2.354 | 95.929 |
| 2.353 | 95.884 |
| 2.352 | 95.814 |
| 2.351 | 95.818 |
| 2.35 | 95.836 |
| 2.349 | 95.924 |
| 2.348 | 95.853 |
| 2.347 | 95.853 |
| 2.346 | 95.821 |
| 2.345 | 95.83 |
| 2.344 | 95.816 |
| 2.343 | 95.852 |
| 2.342 | 95.83 |
| 2.341 | 95.816 |
| 2.34 | 95.802 |
| 2.339 | 95.802 |
| 2.338 | 95.819 |
| 2.337 | 95.79 |
| 2.336 | 95.767 |
| 2.335 | 95.796 |
| 2.334 | 95.761 |
| 2.333 | 95.78 |
| 2.332 | 95.746 |
| 2.331 | 95.762 |
| 2.33 | 95.726 |
| 2.329 | 95.721 |
| 2.328 | 95.766 |
| 2.327 | 95.78 |
| 2.326 | 95.727 |
| 2.325 | 95.733 |
| 2.324 | 95.699 |
| 2.323 | 95.728 |
| 2.322 | 95.712 |
| 2.321 | 95.7 |
| 2.32 | 95.681 |
| 2.319 | 95.715 |
| 2.318 | 95.77 |
| 2.317 | 95.765 |
| 2.316 | 95.699 |
| 2.315 | 95.691 |
| 2.314 | 95.648 |
| 2.313 | 95.73 |
| 2.312 | 95.677 |
| 2.311 | 95.748 |
| 2.31 | 95.732 |
| 2.309 | 95.737 |
| 2.308 | 95.707 |
| 2.307 | 95.676 |
| 2.306 | 95.685 |
| 2.305 | 95.727 |
| 2.304 | 95.646 |
| 2.303 | 95.753 |
| 2.302 | 95.694 |
| 2.301 | 95.756 |
| 2.3 | 95.711 |
| 2.299 | 95.696 |
| 2.298 | 95.751 |
| 2.297 | 95.79 |
| 2.296 | 95.788 |
| 2.295 | 95.676 |
| 2.294 | 95.732 |
| 2.293 | 95.722 |
| 2.292 | 95.674 |
| 2.291 | 95.858 |
| 2.29 | 95.524 |
| 2.289 | 95.839 |
| 2.288 | 95.747 |
| 2.287 | 95.849 |
| 2.286 | 95.792 |
| 2.285 | 95.892 |
| 2.284 | 95.733 |
| 2.283 | 95.656 |
| 2.282 | 95.676 |
| 2.281 | 95.894 |
| 2.28 | 95.65 |
| 2.279 | 95.649 |
| 2.278 | 95.727 |
| 2.277 | 95.839 |
| 2.276 | 95.682 |
| 2.275 | 95.762 |
| 2.274 | 95.796 |
| 2.273 | 95.695 |
| 2.272 | 95.653 |
| 2.271 | 95.827 |
| 2.27 | 95.694 |
| 2.269 | 95.78 |
| 2.268 | 95.815 |
| 2.267 | 95.776 |
| 2.266 | 95.995 |
| 2.265 | 95.771 |
| 2.264 | 95.686 |
| 2.263 | 95.783 |
| 2.262 | 95.918 |
| 2.261 | 95.921 |
| 2.26 | 95.932 |
| 2.259 | 95.788 |
| 2.258 | 96.033 |
| 2.257 | 95.907 |
| 2.256 | 95.868 |
| 2.255 | 95.847 |
| 2.254 | 95.889 |
| 2.253 | 95.788 |
| 2.252 | 95.981 |
| 2.251 | 95.947 |
| 2.25 | 96.023 |
| 2.249 | 96.162 |
| 2.248 | 96.103 |
| 2.247 | 96.166 |
| 2.246 | 96.102 |
| 2.245 | 96.305 |
| 2.244 | 96.068 |
| 2.243 | 96.076 |
| 2.242 | 96.003 |
| 2.241 | 96.12 |
| 2.24 | 96.056 |
| 2.239 | 96.249 |
| 2.238 | 96.195 |
| 2.237 | 96.256 |
| 2.236 | 96.195 |
| 2.235 | 96.225 |
| 2.234 | 96.138 |
| 2.233 | 96.288 |
| 2.232 | 96.322 |
| 2.231 | 96.324 |
| 2.23 | 96.142 |
| 2.229 | 96.314 |
| 2.228 | 96.227 |
| 2.227 | 96.357 |
| 2.226 | 96.293 |
| 2.225 | 96.361 |
| 2.224 | 96.401 |
| 2.223 | 96.285 |
| 2.222 | 96.425 |
| 2.221 | 96.362 |
| 2.22 | 96.487 |
| 2.219 | 96.337 |
| 2.218 | 96.42 |
| 2.217 | 96.403 |
| 2.216 | 96.693 |
| 2.215 | 96.525 |
| 2.214 | 96.55 |
| 2.213 | 96.555 |
| 2.212 | 96.52 |
| 2.211 | 96.621 |
| 2.21 | 96.634 |
| 2.209 | 96.519 |
| 2.208 | 96.621 |
| 2.207 | 96.593 |
| 2.206 | 96.679 |
| 2.205 | 96.673 |
| 2.204 | 96.703 |
| 2.203 | 96.713 |
| 2.202 | 96.835 |
| 2.201 | 96.723 |
| 2.2 | 96.847 |
| 2.199 | 96.855 |
| 2.198 | 96.94 |
| 2.197 | 96.825 |
| 2.196 | 96.863 |
| 2.195 | 96.992 |
| 2.194 | 96.928 |
| 2.193 | 96.962 |
| 2.192 | 96.953 |
| 2.191 | 96.942 |
| 2.19 | 96.955 |
| 2.189 | 97.056 |
| 2.188 | 96.966 |
| 2.187 | 97.098 |
| 2.186 | 96.994 |
| 2.185 | 97.145 |
| 2.184 | 97.097 |
| 2.183 | 97.188 |
| 2.182 | 97.256 |
| 2.181 | 97.133 |
| 2.18 | 97.308 |
| 2.179 | 97.336 |
| 2.178 | 97.189 |
| 2.177 | 97.293 |
| 2.176 | 97.364 |
| 2.175 | 97.324 |
| 2.174 | 97.382 |
| 2.173 | 97.394 |
| 2.172 | 97.443 |
| 2.171 | 97.404 |
| 2.17 | 97.454 |
| 2.169 | 97.492 |
| 2.168 | 97.492 |
| 2.167 | 97.607 |
| 2.166 | 97.608 |
| 2.165 | 97.671 |
| 2.164 | 97.627 |
| 2.163 | 97.689 |
| 2.162 | 97.611 |
| 2.161 | 97.644 |
| 2.16 | 97.73 |
| 2.159 | 97.822 |
| 2.158 | 97.698 |
| 2.157 | 97.627 |
| 2.156 | 97.744 |
| 2.155 | 97.952 |
| 2.154 | 97.797 |
| 2.153 | 97.946 |
| 2.152 | 97.92 |
| 2.151 | 97.881 |
| 2.15 | 97.961 |
| 2.149 | 97.948 |
| 2.148 | 97.937 |
| 2.147 | 98.008 |
| 2.146 | 98.018 |
| 2.145 | 98.085 |
| 2.144 | 98.074 |
| 2.143 | 98.061 |
| 2.142 | 98.152 |
| 2.141 | 98.153 |
| 2.14 | 98.248 |
| 2.139 | 98.225 |
| 2.138 | 98.146 |
| 2.137 | 98.196 |
| 2.136 | 98.292 |
| 2.135 | 98.388 |
| 2.134 | 98.307 |
| 2.133 | 98.333 |
| 2.132 | 98.306 |
| 2.131 | 98.372 |
| 2.13 | 98.346 |
| 2.129 | 98.366 |
| 2.128 | 98.439 |
| 2.127 | 98.427 |
| 2.126 | 98.378 |
| 2.125 | 98.515 |
| 2.124 | 98.487 |
| 2.123 | 98.548 |
| 2.122 | 98.561 |
| 2.121 | 98.57 |
| 2.12 | 98.62 |
| 2.119 | 98.695 |
| 2.118 | 98.613 |
| 2.117 | 98.755 |
| 2.116 | 98.685 |
| 2.115 | 98.601 |
| 2.114 | 98.773 |
| 2.113 | 98.761 |
| 2.112 | 98.777 |
| 2.111 | 98.801 |
| 2.11 | 98.684 |
| 2.109 | 98.691 |
| 2.108 | 98.771 |
| 2.107 | 98.785 |
| 2.106 | 98.847 |
| 2.105 | 98.91 |
| 2.104 | 98.889 |
| 2.103 | 98.931 |
| 2.102 | 98.861 |
| 2.101 | 98.842 |
| 2.1 | 98.958 |
| 2.099 | 98.843 |
| 2.098 | 98.937 |
| 2.097 | 98.88 |
| 2.096 | 98.94 |
| 2.095 | 98.94 |
| 2.094 | 98.979 |
| 2.093 | 98.966 |
| 2.092 | 98.917 |
| 2.091 | 98.93 |
| 2.09 | 98.842 |
| 2.089 | 98.958 |
| 2.088 | 99.035 |
| 2.087 | 98.941 |
| 2.086 | 99.052 |
| 2.085 | 99.054 |
| 2.084 | 99 |
| 2.083 | 99.059 |
| 2.082 | 98.968 |
| 2.081 | 98.961 |
| 2.08 | 98.893 |
| 2.079 | 99.028 |
| 2.078 | 98.901 |
| 2.077 | 98.922 |
| 2.076 | 98.91 |
| 2.075 | 98.932 |
| 2.074 | 98.911 |
| 2.073 | 98.898 |
| 2.072 | 98.948 |
| 2.071 | 98.937 |
| 2.07 | 98.913 |
| 2.069 | 98.858 |
| 2.068 | 98.893 |
| 2.067 | 98.859 |
| 2.066 | 98.864 |
| 2.065 | 98.858 |
| 2.064 | 98.786 |
| 2.063 | 98.863 |
| 2.062 | 98.756 |
| 2.061 | 98.805 |
| 2.06 | 98.718 |
| 2.059 | 98.754 |
| 2.058 | 98.65 |
| 2.057 | 98.678 |
| 2.056 | 98.729 |
| 2.055 | 98.666 |
| 2.054 | 98.607 |
| 2.053 | 98.573 |
| 2.052 | 98.543 |
| 2.051 | 98.507 |
| 2.05 | 98.42 |
| 2.049 | 98.477 |
| 2.048 | 98.429 |
| 2.047 | 98.407 |
| 2.046 | 98.335 |
| 2.045 | 98.362 |
| 2.044 | 98.285 |
| 2.043 | 98.208 |
| 2.042 | 98.267 |
| 2.041 | 98.14 |
| 2.04 | 98.164 |
| 2.039 | 98.154 |
| 2.038 | 98.069 |
| 2.037 | 97.999 |
| 2.036 | 97.856 |
| 2.035 | 97.927 |
| 2.034 | 97.908 |
| 2.033 | 97.811 |
| 2.032 | 97.694 |
| 2.031 | 97.649 |
| 2.03 | 97.613 |
| 2.029 | 97.671 |
| 2.028 | 97.554 |
| 2.027 | 97.445 |
| 2.026 | 97.356 |
| 2.025 | 97.363 |
| 2.024 | 97.251 |
| 2.023 | 97.193 |
| 2.022 | 97.106 |
| 2.021 | 97.064 |
| 2.02 | 96.988 |
| 2.019 | 96.942 |
| 2.018 | 96.865 |
| 2.017 | 96.75 |
| 2.016 | 96.695 |
| 2.015 | 96.665 |
| 2.014 | 96.55 |
| 2.013 | 96.451 |
| 2.012 | 96.393 |
| 2.011 | 96.302 |
| 2.01 | 96.168 |
| 2.009 | 96.17 |
| 2.008 | 96.031 |
| 2.007 | 95.906 |
| 2.006 | 95.794 |
| 2.005 | 95.771 |
| 2.004 | 95.717 |
| 2.003 | 95.564 |
| 2.002 | 95.459 |
| 2.001 | 95.368 |
| 2.0 | 95.233 |
| 1.999 | 95.131 |
| 1.998 | 94.989 |
| 1.997 | 94.901 |
| 1.996 | 94.795 |
| 1.995 | 94.656 |
| 1.994 | 94.596 |
| 1.993 | 94.444 |
| 1.992 | 94.324 |
| 1.991 | 94.218 |
| 1.99 | 94.078 |
| 1.989 | 93.962 |
| 1.988 | 93.762 |
| 1.987 | 93.76 |
| 1.986 | 93.645 |
| 1.985 | 93.445 |
| 1.984 | 93.288 |
| 1.983 | 93.152 |
| 1.982 | 92.991 |
| 1.981 | 92.917 |
| 1.98 | 92.737 |
| 1.979 | 92.599 |
| 1.978 | 92.492 |
| 1.977 | 92.349 |
| 1.976 | 92.268 |
| 1.975 | 92.047 |
| 1.974 | 91.974 |
| 1.973 | 91.809 |
| 1.972 | 91.594 |
| 1.971 | 91.496 |
| 1.97 | 91.365 |
| 1.969 | 91.138 |
| 1.968 | 90.988 |
| 1.967 | 90.825 |
| 1.966 | 90.646 |
| 1.965 | 90.468 |
| 1.964 | 90.328 |
| 1.963 | 90.175 |
| 1.962 | 89.986 |
| 1.961 | 89.817 |
| 1.96 | 89.655 |
| 1.959 | 89.502 |
| 1.958 | 89.226 |
| 1.957 | 89.143 |
| 1.956 | 88.962 |
| 1.955 | 88.771 |
| 1.954 | 88.598 |
| 1.953 | 88.358 |
| 1.952 | 88.204 |
| 1.951 | 88.062 |
| 1.95 | 87.856 |
| 1.949 | 87.638 |
| 1.948 | 87.4 |
| 1.947 | 87.264 |
| 1.946 | 87.119 |
| 1.945 | 86.895 |
| 1.944 | 86.649 |
| 1.943 | 86.514 |
| 1.942 | 86.284 |
| 1.941 | 86.078 |
| 1.94 | 85.869 |
| 1.939 | 85.693 |
| 1.938 | 85.497 |
| 1.937 | 85.238 |
| 1.936 | 85.049 |
| 1.935 | 84.807 |
| 1.934 | 84.599 |
| 1.933 | 84.434 |
| 1.932 | 84.228 |
| 1.931 | 84.026 |
| 1.93 | 83.768 |
| 1.929 | 83.505 |
| 1.928 | 83.357 |
| 1.927 | 83.073 |
| 1.926 | 82.882 |
| 1.925 | 82.683 |
| 1.924 | 82.402 |
| 1.923 | 82.287 |
| 1.922 | 82.02 |
| 1.921 | 81.797 |
| 1.92 | 81.574 |
| 1.919 | 81.312 |
| 1.918 | 81.051 |
| 1.917 | 80.838 |
| 1.916 | 80.64 |
| 1.915 | 80.418 |
| 1.914 | 80.202 |
| 1.913 | 79.978 |
| 1.912 | 79.666 |
| 1.911 | 79.405 |
| 1.91 | 79.164 |
| 1.909 | 78.965 |
| 1.908 | 78.759 |
| 1.907 | 78.541 |
| 1.906 | 78.313 |
| 1.905 | 78.028 |
| 1.904 | 77.788 |
| 1.903 | 77.558 |
| 1.902 | 77.303 |
| 1.901 | 77.125 |
| 1.9 | 76.874 |
| 1.899 | 76.611 |
| 1.898 | 76.293 |
| 1.897 | 76.08 |
| 1.896 | 75.877 |
| 1.895 | 75.57 |
| 1.894 | 75.346 |
| 1.893 | 75.094 |
| 1.892 | 74.934 |
| 1.891 | 74.648 |
| 1.89 | 74.364 |
| 1.889 | 74.102 |
| 1.888 | 73.844 |
| 1.887 | 73.579 |
| 1.886 | 73.401 |
| 1.885 | 73.082 |
| 1.884 | 72.856 |
| 1.883 | 72.611 |
| 1.882 | 72.361 |
| 1.881 | 72.146 |
| 1.88 | 71.866 |
| 1.879 | 71.621 |
| 1.878 | 71.437 |
| 1.877 | 71.121 |
| 1.876 | 70.929 |
| 1.875 | 70.62 |
| 1.874 | 70.368 |
| 1.873 | 70.12 |
| 1.872 | 69.876 |
| 1.871 | 69.624 |
| 1.87 | 69.385 |
| 1.869 | 69.134 |
| 1.868 | 68.861 |
| 1.867 | 68.595 |
| 1.866 | 68.339 |
| 1.865 | 68.12 |
| 1.864 | 67.814 |
| 1.863 | 67.613 |
| 1.862 | 67.385 |
| 1.861 | 67.143 |
| 1.86 | 66.857 |
| 1.859 | 66.63 |
| 1.858 | 66.306 |
| 1.857 | 66.102 |
| 1.856 | 65.857 |
| 1.855 | 65.633 |
| 1.854 | 65.302 |
| 1.853 | 65.154 |
| 1.852 | 64.855 |
| 1.851 | 64.668 |
| 1.85 | 64.452 |
| 1.849 | 64.222 |
| 1.848 | 63.905 |
| 1.847 | 63.639 |
| 1.846 | 63.365 |
| 1.845 | 63.159 |
| 1.844 | 62.955 |
| 1.843 | 62.742 |
| 1.842 | 62.502 |
| 1.841 | 62.263 |
| 1.84 | 61.983 |
| 1.839 | 61.717 |
| 1.838 | 61.427 |
| 1.837 | 61.271 |
| 1.836 | 61.029 |
| 1.835 | 60.748 |
| 1.834 | 60.532 |
| 1.833 | 60.335 |
| 1.832 | 60.125 |
| 1.831 | 59.886 |
| 1.83 | 59.643 |
| 1.829 | 59.39 |
| 1.828 | 59.169 |
| 1.827 | 58.96 |
| 1.826 | 58.738 |
| 1.825 | 58.505 |
| 1.824 | 58.311 |
| 1.823 | 58.112 |
| 1.822 | 57.862 |
| 1.821 | 57.625 |
| 1.82 | 57.349 |
| 1.819 | 57.173 |
| 1.818 | 56.974 |
| 1.817 | 56.739 |
| 1.816 | 56.521 |
| 1.815 | 56.27 |
| 1.814 | 56.085 |
| 1.813 | 55.893 |
| 1.812 | 55.655 |
| 1.811 | 55.441 |
| 1.81 | 55.215 |
| 1.809 | 55.028 |
| 1.808 | 54.791 |
| 1.807 | 54.632 |
| 1.806 | 54.406 |
| 1.805 | 54.187 |
| 1.804 | 53.965 |
| 1.803 | 53.784 |
| 1.802 | 53.586 |
| 1.801 | 53.353 |
| 1.8 | 53.199 |
| 1.799 | 52.998 |
| 1.798 | 52.747 |
| 1.797 | 52.545 |
| 1.796 | 52.36 |
| 1.795 | 52.198 |
| 1.794 | 52.029 |
| 1.793 | 51.775 |
| 1.792 | 51.617 |
| 1.791 | 51.419 |
| 1.79 | 51.237 |
| 1.789 | 51.04 |
| 1.788 | 50.84 |
| 1.787 | 50.656 |
| 1.786 | 50.512 |
| 1.785 | 50.293 |
| 1.784 | 50.139 |
| 1.783 | 49.936 |
| 1.782 | 49.775 |
| 1.781 | 49.655 |
| 1.78 | 49.443 |
| 1.779 | 49.263 |
| 1.778 | 49.07 |
| 1.777 | 48.912 |
| 1.776 | 48.709 |
| 1.775 | 48.56 |
| 1.774 | 48.408 |
| 1.773 | 48.252 |
| 1.772 | 48.049 |
| 1.771 | 47.86 |
| 1.77 | 47.715 |
| 1.769 | 47.558 |
| 1.768 | 47.381 |
| 1.767 | 47.226 |
| 1.766 | 47.089 |
| 1.765 | 46.928 |
| 1.764 | 46.755 |
| 1.763 | 46.669 |
| 1.762 | 46.489 |
| 1.761 | 46.321 |
| 1.76 | 46.172 |
| 1.759 | 46.024 |
| 1.758 | 45.869 |
| 1.757 | 45.735 |
| 1.756 | 45.605 |
| 1.755 | 45.462 |
| 1.754 | 45.319 |
| 1.753 | 45.154 |
| 1.752 | 44.997 |
| 1.751 | 44.892 |
| 1.75 | 44.787 |
| 1.749 | 44.631 |
| 1.748 | 44.485 |
| 1.747 | 44.373 |
| 1.746 | 44.238 |
| 1.745 | 44.085 |
| 1.744 | 43.949 |
| 1.743 | 43.846 |
| 1.742 | 43.717 |
| 1.741 | 43.602 |
| 1.74 | 43.468 |
| 1.739 | 43.329 |
| 1.738 | 43.223 |
| 1.737 | 43.11 |
| 1.736 | 42.996 |
| 1.735 | 42.874 |
| 1.734 | 42.764 |
| 1.733 | 42.672 |
| 1.732 | 42.54 |
| 1.731 | 42.427 |
| 1.73 | 42.317 |
| 1.729 | 42.21 |
| 1.728 | 42.107 |
| 1.727 | 42.024 |
| 1.726 | 41.901 |
| 1.725 | 41.824 |
| 1.724 | 41.698 |
| 1.723 | 41.583 |
| 1.722 | 41.52 |
| 1.721 | 41.416 |
| 1.72 | 41.293 |
| 1.719 | 41.202 |
| 1.718 | 41.117 |
| 1.717 | 41.035 |
| 1.716 | 40.947 |
| 1.715 | 40.872 |
| 1.714 | 40.765 |
| 1.713 | 40.682 |
| 1.712 | 40.639 |
| 1.711 | 40.537 |
| 1.71 | 40.439 |
| 1.709 | 40.373 |
| 1.708 | 40.274 |
| 1.707 | 40.195 |
| 1.706 | 40.133 |
| 1.705 | 40.052 |
| 1.704 | 39.974 |
| 1.703 | 39.918 |
| 1.702 | 39.871 |
| 1.701 | 39.776 |
| 1.7 | 39.689 |
| 1.699 | 39.661 |
| 1.698 | 39.6 |
| 1.697 | 39.53 |
| 1.696 | 39.479 |
| 1.695 | 39.418 |
| 1.694 | 39.385 |
| 1.693 | 39.3 |
| 1.692 | 39.239 |
| 1.691 | 39.215 |
| 1.69 | 39.15 |
| 1.689 | 39.092 |
| 1.688 | 39.05 |
| 1.687 | 38.972 |
| 1.686 | 38.917 |
| 1.685 | 38.908 |
| 1.684 | 38.861 |
| 1.683 | 38.81 |
| 1.682 | 38.776 |
| 1.681 | 38.736 |
| 1.68 | 38.709 |
| 1.679 | 38.661 |
| 1.678 | 38.636 |
| 1.677 | 38.615 |
| 1.676 | 38.569 |
| 1.675 | 38.563 |
| 1.674 | 38.518 |
| 1.673 | 38.481 |
| 1.672 | 38.489 |
| 1.671 | 38.463 |
| 1.67 | 38.426 |
| 1.669 | 38.415 |
| 1.668 | 38.39 |
| 1.667 | 38.381 |
| 1.666 | 38.334 |
| 1.665 | 38.374 |
| 1.664 | 38.356 |
| 1.663 | 38.336 |
| 1.662 | 38.351 |
| 1.661 | 38.318 |
| 1.66 | 38.313 |
| 1.659 | 38.323 |
| 1.658 | 38.308 |
| 1.657 | 38.331 |
| 1.656 | 38.307 |
| 1.655 | 38.343 |
| 1.654 | 38.335 |
| 1.653 | 38.327 |
| 1.652 | 38.356 |
| 1.651 | 38.364 |
| 1.65 | 38.364 |
| 1.649 | 38.414 |
| 1.648 | 38.42 |
| 1.647 | 38.451 |
| 1.646 | 38.462 |
| 1.645 | 38.485 |
| 1.644 | 38.493 |
| 1.643 | 38.546 |
| 1.642 | 38.559 |
| 1.641 | 38.601 |
| 1.64 | 38.619 |
| 1.639 | 38.637 |
| 1.638 | 38.698 |
| 1.637 | 38.741 |
| 1.636 | 38.778 |
| 1.635 | 38.805 |
| 1.634 | 38.854 |
| 1.633 | 38.901 |
| 1.632 | 38.936 |
| 1.631 | 38.989 |
| 1.63 | 39.043 |
| 1.629 | 39.113 |
| 1.628 | 39.169 |
| 1.627 | 39.232 |
| 1.626 | 39.297 |
| 1.625 | 39.342 |
| 1.624 | 39.405 |
| 1.623 | 39.501 |
| 1.622 | 39.55 |
| 1.621 | 39.665 |
| 1.62 | 39.695 |
| 1.619 | 39.791 |
| 1.618 | 39.86 |
| 1.617 | 39.959 |
| 1.616 | 40.031 |
| 1.615 | 40.118 |
| 1.614 | 40.217 |
| 1.613 | 40.301 |
| 1.612 | 40.423 |
| 1.611 | 40.503 |
| 1.61 | 40.596 |
| 1.609 | 40.713 |
| 1.608 | 40.784 |
| 1.607 | 40.904 |
| 1.606 | 41.025 |
| 1.605 | 41.141 |
| 1.604 | 41.271 |
| 1.603 | 41.379 |
| 1.602 | 41.495 |
| 1.601 | 41.629 |
| 1.6 | 41.743 |
| 1.599 | 41.866 |
| 1.598 | 42.021 |
| 1.597 | 42.156 |
| 1.596 | 42.279 |
| 1.595 | 42.429 |
| 1.594 | 42.57 |
| 1.593 | 42.72 |
| 1.592 | 42.861 |
| 1.591 | 43.024 |
| 1.59 | 43.174 |
| 1.589 | 43.33 |
| 1.588 | 43.53 |
| 1.587 | 43.666 |
| 1.586 | 43.841 |
| 1.585 | 44.022 |
| 1.584 | 44.198 |
| 1.583 | 44.381 |
| 1.582 | 44.558 |
| 1.581 | 44.74 |
| 1.58 | 44.946 |
| 1.579 | 45.151 |
| 1.578 | 45.343 |
| 1.577 | 45.545 |
| 1.576 | 45.75 |
| 1.575 | 45.963 |
| 1.574 | 46.185 |
| 1.573 | 46.408 |
| 1.572 | 46.631 |
| 1.571 | 46.839 |
| 1.57 | 47.051 |
| 1.569 | 47.296 |
| 1.568 | 47.549 |
| 1.567 | 47.795 |
| 1.566 | 48.047 |
| 1.565 | 48.303 |
| 1.564 | 48.544 |
| 1.563 | 48.825 |
| 1.562 | 49.087 |
| 1.561 | 49.348 |
| 1.56 | 49.638 |
| 1.559 | 49.928 |
| 1.558 | 50.212 |
| 1.557 | 50.511 |
| 1.556 | 50.807 |
| 1.555 | 51.078 |
| 1.554 | 51.402 |
| 1.553 | 51.709 |
| 1.552 | 52.021 |
| 1.551 | 52.331 |
| 1.55 | 52.679 |
| 1.549 | 52.986 |
| 1.548 | 53.331 |
| 1.547 | 53.675 |
| 1.546 | 54.04 |
| 1.545 | 54.385 |
| 1.544 | 54.738 |
| 1.543 | 55.095 |
| 1.542 | 55.47 |
| 1.541 | 55.84 |
| 1.54 | 56.236 |
| 1.539 | 56.617 |
| 1.538 | 56.988 |
| 1.537 | 57.371 |
| 1.536 | 57.756 |
| 1.535 | 58.164 |
| 1.534 | 58.625 |
| 1.533 | 59.026 |
| 1.532 | 59.459 |
| 1.531 | 59.9 |
| 1.53 | 60.317 |
| 1.529 | 60.775 |
| 1.528 | 61.238 |
| 1.527 | 61.704 |
| 1.526 | 62.146 |
| 1.525 | 62.622 |
| 1.524 | 63.065 |
| 1.523 | 63.562 |
| 1.522 | 64.049 |
| 1.521 | 64.537 |
| 1.52 | 65.008 |
| 1.519 | 65.524 |
| 1.518 | 66.025 |
| 1.517 | 66.538 |
| 1.516 | 67.053 |
| 1.515 | 67.59 |
| 1.514 | 68.114 |
| 1.513 | 68.636 |
| 1.512 | 69.177 |
| 1.511 | 69.7 |
| 1.51 | 70.256 |
| 1.509 | 70.823 |
| 1.508 | 71.377 |
| 1.507 | 71.912 |
| 1.506 | 72.48 |
| 1.505 | 73.026 |
| 1.504 | 73.598 |
| 1.503 | 74.193 |
| 1.502 | 74.784 |
| 1.501 | 75.325 |
| 1.5 | 75.912 |
| 1.499 | 76.494 |
| 1.498 | 77.055 |
| 1.497 | 77.667 |
| 1.496 | 78.265 |
| 1.495 | 78.831 |
| 1.494 | 79.408 |
| 1.493 | 79.994 |
| 1.492 | 80.555 |
| 1.491 | 81.148 |
| 1.49 | 81.741 |
| 1.489 | 82.348 |
| 1.488 | 82.9 |
| 1.487 | 83.479 |
| 1.486 | 84.051 |
| 1.485 | 84.603 |
| 1.484 | 85.156 |
| 1.483 | 85.718 |
| 1.482 | 86.254 |
| 1.481 | 86.782 |
| 1.48 | 87.317 |
| 1.479 | 87.811 |
| 1.478 | 88.337 |
| 1.477 | 88.87 |
| 1.476 | 89.395 |
| 1.475 | 89.858 |
| 1.474 | 90.31 |
| 1.473 | 90.774 |
| 1.472 | 91.204 |
| 1.471 | 91.611 |
| 1.47 | 92.052 |
| 1.469 | 92.43 |
| 1.468 | 92.803 |
| 1.467 | 93.156 |
| 1.466 | 93.485 |
| 1.465 | 93.807 |
| 1.464 | 94.106 |
| 1.463 | 94.397 |
| 1.462 | 94.646 |
| 1.461 | 94.883 |
| 1.46 | 95.076 |
| 1.459 | 95.254 |
| 1.458 | 95.455 |
| 1.457 | 95.59 |
| 1.456 | 95.686 |
| 1.455 | 95.769 |
| 1.454 | 95.824 |
| 1.453 | 95.873 |
| 1.452 | 95.874 |
| 1.451 | 95.86 |
| 1.45 | 95.827 |
| 1.449 | 95.758 |
| 1.448 | 95.653 |
| 1.447 | 95.524 |
| 1.446 | 95.398 |
| 1.445 | 95.213 |
| 1.444 | 95.003 |
| 1.443 | 94.761 |
| 1.442 | 94.495 |
| 1.441 | 94.229 |
| 1.44 | 93.891 |
| 1.439 | 93.552 |
| 1.438 | 93.188 |
| 1.437 | 92.803 |
| 1.436 | 92.406 |
| 1.435 | 91.931 |
| 1.434 | 91.488 |
| 1.433 | 90.987 |
| 1.432 | 90.45 |
| 1.431 | 89.934 |
| 1.43 | 89.387 |
| 1.429 | 88.814 |
| 1.428 | 88.231 |
| 1.427 | 87.613 |
| 1.426 | 86.981 |
| 1.425 | 86.342 |
| 1.424 | 85.673 |
| 1.423 | 84.984 |
| 1.422 | 84.309 |
| 1.421 | 83.624 |
| 1.42 | 82.885 |
| 1.419 | 82.134 |
| 1.418 | 81.419 |
| 1.417 | 80.663 |
| 1.416 | 79.904 |
| 1.415 | 79.162 |
| 1.414 | 78.375 |
| 1.413 | 77.571 |
| 1.412 | 76.824 |
| 1.411 | 76.049 |
| 1.41 | 75.287 |
| 1.409 | 74.495 |
| 1.408 | 73.69 |
| 1.407 | 72.86 |
| 1.406 | 72.013 |
| 1.405 | 71.242 |
| 1.404 | 70.463 |
| 1.403 | 69.659 |
| 1.402 | 68.903 |
| 1.401 | 68.033 |
| 1.4 | 67.209 |
| 1.399 | 66.436 |
| 1.398 | 65.667 |
| 1.397 | 64.914 |
| 1.396 | 64.144 |
| 1.395 | 63.353 |
| 1.394 | 62.525 |
| 1.393 | 61.766 |
| 1.392 | 61.015 |
| 1.391 | 60.276 |
| 1.39 | 59.534 |
| 1.389 | 58.842 |
| 1.388 | 58.084 |
| 1.387 | 57.337 |
| 1.386 | 56.675 |
| 1.385 | 55.991 |
| 1.384 | 55.321 |
| 1.383 | 54.6 |
| 1.382 | 53.876 |
| 1.381 | 53.127 |
| 1.38 | 52.458 |
| 1.379 | 51.807 |
| 1.378 | 51.141 |
| 1.377 | 50.546 |
| 1.376 | 49.935 |
| 1.375 | 49.291 |
| 1.374 | 48.699 |
| 1.373 | 48.134 |
| 1.372 | 47.546 |
| 1.371 | 46.945 |
| 1.37 | 46.371 |
| 1.369 | 45.757 |
| 1.368 | 45.166 |
| 1.367 | 44.662 |
| 1.366 | 44.123 |
| 1.365 | 43.601 |
| 1.364 | 43.106 |
| 1.363 | 42.545 |
| 1.362 | 42.012 |
| 1.361 | 41.491 |
| 1.36 | 41 |
| 1.359 | 40.503 |
| 1.358 | 40.05 |
| 1.357 | 39.598 |
| 1.356 | 39.115 |
| 1.355 | 38.64 |
| 1.354 | 38.18 |
| 1.353 | 37.764 |
| 1.352 | 37.318 |
| 1.351 | 36.917 |
| 1.35 | 36.503 |
| 1.349 | 36.085 |
| 1.348 | 35.712 |
| 1.347 | 35.308 |
| 1.346 | 34.932 |
| 1.345 | 34.566 |
| 1.344 | 34.172 |
| 1.343 | 33.816 |
| 1.342 | 33.458 |
| 1.341 | 33.123 |
| 1.34 | 32.755 |
| 1.339 | 32.441 |
| 1.338 | 32.101 |
| 1.337 | 31.761 |
| 1.336 | 31.462 |
| 1.335 | 31.147 |
| 1.334 | 30.847 |
| 1.333 | 30.541 |
| 1.332 | 30.232 |
| 1.331 | 29.935 |
| 1.33 | 29.644 |
| 1.329 | 29.371 |
| 1.328 | 29.104 |
| 1.327 | 28.838 |
| 1.326 | 28.573 |
| 1.325 | 28.303 |
| 1.324 | 28.059 |
| 1.323 | 27.807 |
| 1.322 | 27.558 |
| 1.321 | 27.326 |
| 1.32 | 27.08 |
| 1.319 | 26.866 |
| 1.318 | 26.629 |
| 1.317 | 26.402 |
| 1.316 | 26.183 |
| 1.315 | 25.971 |
| 1.314 | 25.769 |
| 1.313 | 25.563 |
| 1.312 | 25.351 |
| 1.311 | 25.141 |
| 1.31 | 24.983 |
| 1.309 | 24.781 |
| 1.308 | 24.599 |
| 1.307 | 24.413 |
| 1.306 | 24.242 |
| 1.305 | 24.056 |
| 1.304 | 23.88 |
| 1.303 | 23.727 |
| 1.302 | 23.565 |
| 1.301 | 23.413 |
| 1.3 | 23.247 |
| 1.299 | 23.094 |
| 1.298 | 22.927 |
| 1.297 | 22.797 |
| 1.296 | 22.66 |
| 1.295 | 22.502 |
| 1.294 | 22.379 |
| 1.293 | 22.24 |
| 1.292 | 22.114 |
| 1.291 | 21.985 |
| 1.29 | 21.858 |
| 1.289 | 21.735 |
| 1.288 | 21.615 |
| 1.287 | 21.497 |
| 1.286 | 21.377 |
| 1.285 | 21.269 |
| 1.284 | 21.16 |
| 1.283 | 21.049 |
| 1.282 | 20.944 |
| 1.281 | 20.846 |
| 1.28 | 20.752 |
| 1.279 | 20.643 |
| 1.278 | 20.575 |
| 1.277 | 20.47 |
| 1.276 | 20.373 |
| 1.275 | 20.306 |
| 1.274 | 20.196 |
| 1.273 | 20.11 |
| 1.272 | 20.049 |
| 1.271 | 19.984 |
| 1.27 | 19.881 |
| 1.269 | 19.81 |
| 1.268 | 19.75 |
| 1.267 | 19.666 |
| 1.266 | 19.606 |
| 1.265 | 19.546 |
| 1.264 | 19.472 |
| 1.263 | 19.418 |
| 1.262 | 19.363 |
| 1.261 | 19.308 |
| 1.26 | 19.239 |
| 1.259 | 19.175 |
| 1.258 | 19.147 |
| 1.257 | 19.089 |
| 1.256 | 19.022 |
| 1.255 | 18.99 |
| 1.254 | 18.956 |
| 1.253 | 18.919 |
| 1.252 | 18.837 |
| 1.251 | 18.825 |
| 1.25 | 18.779 |
| 1.249 | 18.745 |
| 1.248 | 18.728 |
| 1.247 | 18.695 |
| 1.246 | 18.65 |
| 1.245 | 18.63 |
| 1.244 | 18.603 |
| 1.243 | 18.578 |
| 1.242 | 18.55 |
| 1.241 | 18.527 |
| 1.24 | 18.517 |
| 1.239 | 18.475 |
| 1.238 | 18.465 |
| 1.237 | 18.446 |
| 1.236 | 18.451 |
| 1.235 | 18.424 |
| 1.234 | 18.413 |
| 1.233 | 18.388 |
| 1.232 | 18.393 |
| 1.231 | 18.367 |
| 1.23 | 18.383 |
| 1.229 | 18.37 |
| 1.228 | 18.37 |
| 1.227 | 18.358 |
| 1.226 | 18.355 |
| 1.225 | 18.347 |
| 1.224 | 18.378 |
| 1.223 | 18.366 |
| 1.222 | 18.397 |
| 1.221 | 18.392 |
| 1.22 | 18.369 |
| 1.219 | 18.404 |
| 1.218 | 18.412 |
| 1.217 | 18.417 |
| 1.216 | 18.452 |
| 1.215 | 18.455 |
| 1.214 | 18.481 |
| 1.213 | 18.498 |
| 1.212 | 18.498 |
| 1.211 | 18.523 |
| 1.21 | 18.544 |
| 1.209 | 18.584 |
| 1.208 | 18.591 |
| 1.207 | 18.633 |
| 1.206 | 18.657 |
| 1.205 | 18.682 |
| 1.204 | 18.696 |
| 1.203 | 18.733 |
| 1.202 | 18.752 |
| 1.201 | 18.784 |
| 1.2 | 18.834 |
| 1.199 | 18.792 |
| 1.198 | 18.842 |
| 1.197 | 18.877 |
| 1.196 | 18.914 |
| 1.195 | 18.953 |
| 1.194 | 19.004 |
| 1.193 | 19.03 |
| 1.192 | 19.077 |
| 1.191 | 19.125 |
| 1.19 | 19.171 |
| 1.189 | 19.23 |
| 1.188 | 19.262 |
| 1.187 | 19.31 |
| 1.186 | 19.369 |
| 1.185 | 19.421 |
| 1.184 | 19.485 |
| 1.183 | 19.507 |
| 1.182 | 19.586 |
| 1.181 | 19.629 |
| 1.18 | 19.695 |
| 1.179 | 19.763 |
| 1.178 | 19.816 |
| 1.177 | 19.892 |
| 1.176 | 19.948 |
| 1.175 | 19.993 |
| 1.174 | 20.08 |
| 1.173 | 20.143 |
| 1.172 | 20.207 |
| 1.171 | 20.284 |
| 1.17 | 20.331 |
| 1.169 | 20.429 |
| 1.168 | 20.507 |
| 1.167 | 20.573 |
| 1.166 | 20.638 |
| 1.165 | 20.726 |
| 1.164 | 20.793 |
| 1.163 | 20.901 |
| 1.162 | 20.968 |
| 1.161 | 21.046 |
| 1.16 | 21.122 |
| 1.159 | 21.215 |
| 1.158 | 21.314 |
| 1.157 | 21.395 |
| 1.156 | 21.497 |
| 1.155 | 21.564 |
| 1.154 | 21.669 |
| 1.153 | 21.785 |
| 1.152 | 21.859 |
| 1.151 | 21.976 |
| 1.15 | 22.062 |
| 1.149 | 22.138 |
| 1.148 | 22.273 |
| 1.147 | 22.374 |
| 1.146 | 22.485 |
| 1.145 | 22.612 |
| 1.144 | 22.696 |
| 1.143 | 22.814 |
| 1.142 | 22.908 |
| 1.141 | 23.051 |
| 1.14 | 23.167 |
| 1.139 | 23.306 |
| 1.138 | 23.422 |
| 1.137 | 23.52 |
| 1.136 | 23.674 |
| 1.135 | 23.794 |
| 1.134 | 23.928 |
| 1.133 | 24.067 |
| 1.132 | 24.209 |
| 1.131 | 24.356 |
| 1.13 | 24.464 |
| 1.129 | 24.646 |
| 1.128 | 24.776 |
| 1.127 | 24.925 |
| 1.126 | 25.104 |
| 1.125 | 25.236 |
| 1.124 | 25.402 |
| 1.123 | 25.561 |
| 1.122 | 25.722 |
| 1.121 | 25.895 |
| 1.12 | 26.066 |
| 1.119 | 26.234 |
| 1.118 | 26.424 |
| 1.117 | 26.61 |
| 1.116 | 26.803 |
| 1.115 | 26.973 |
| 1.114 | 27.178 |
| 1.113 | 27.36 |
| 1.112 | 27.586 |
| 1.111 | 27.768 |
| 1.11 | 28.013 |
| 1.109 | 28.201 |
| 1.108 | 28.435 |
| 1.107 | 28.666 |
| 1.106 | 28.872 |
| 1.105 | 29.098 |
| 1.104 | 29.328 |
| 1.103 | 29.599 |
| 1.102 | 29.833 |
| 1.101 | 30.132 |
| 1.1 | 30.361 |
| 1.099 | 30.616 |
| 1.098 | 30.888 |
| 1.097 | 31.192 |
| 1.096 | 31.471 |
| 1.095 | 31.763 |
| 1.094 | 32.08 |
| 1.093 | 32.394 |
| 1.092 | 32.676 |
| 1.091 | 33.008 |
| 1.09 | 33.315 |
| 1.089 | 33.675 |
| 1.088 | 34.035 |
| 1.087 | 34.373 |
| 1.086 | 34.727 |
| 1.085 | 35.109 |
| 1.084 | 35.483 |
| 1.083 | 35.877 |
| 1.082 | 36.27 |
| 1.081 | 36.684 |
| 1.08 | 37.087 |
| 1.079 | 37.523 |
| 1.078 | 37.969 |
| 1.077 | 38.39 |
| 1.076 | 38.884 |
| 1.075 | 39.352 |
| 1.074 | 39.815 |
| 1.073 | 40.286 |
| 1.072 | 40.807 |
| 1.071 | 41.333 |
| 1.07 | 41.885 |
| 1.069 | 42.447 |
| 1.068 | 42.975 |
| 1.067 | 43.549 |
| 1.066 | 44.152 |
| 1.065 | 44.743 |
| 1.064 | 45.352 |
| 1.063 | 45.974 |
| 1.062 | 46.632 |
| 1.061 | 47.24 |
| 1.06 | 47.958 |
| 1.059 | 48.605 |
| 1.058 | 49.339 |
| 1.057 | 50.07 |
| 1.056 | 50.811 |
| 1.055 | 51.593 |
| 1.054 | 52.342 |
| 1.053 | 53.156 |
| 1.052 | 53.954 |
| 1.051 | 54.75 |
| 1.05 | 55.635 |
| 1.049 | 56.543 |
| 1.048 | 57.444 |
| 1.047 | 58.335 |
| 1.046 | 59.265 |
| 1.045 | 60.199 |
| 1.044 | 61.168 |
| 1.043 | 62.165 |
| 1.042 | 63.089 |
| 1.041 | 64.084 |
| 1.04 | 65.088 |
| 1.039 | 66.073 |
| 1.038 | 67.135 |
| 1.037 | 68.197 |
| 1.036 | 69.215 |
| 1.035 | 70.258 |
| 1.034 | 71.331 |
| 1.033 | 72.354 |
| 1.032 | 73.485 |
| 1.031 | 74.615 |
| 1.03 | 75.67 |
| 1.029 | 76.76 |
| 1.028 | 77.793 |
| 1.027 | 78.854 |
| 1.026 | 79.92 |
| 1.025 | 81.022 |
| 1.024 | 82.128 |
| 1.023 | 83.11 |
| 1.022 | 84.141 |
| 1.021 | 85.157 |
| 1.02 | 86.097 |
| 1.019 | 87.074 |
| 1.018 | 88.024 |
| 1.017 | 88.91 |
| 1.016 | 89.761 |
| 1.015 | 90.608 |
| 1.014 | 91.382 |
| 1.013 | 92.173 |
| 1.012 | 92.909 |
| 1.011 | 93.558 |
| 1.01 | 94.181 |
| 1.009 | 94.723 |
| 1.008 | 95.245 |
| 1.007 | 95.699 |
| 1.006 | 96.108 |
| 1.005 | 96.469 |
| 1.004 | 96.734 |
| 1.003 | 96.969 |
| 1.002 | 97.142 |
| 1.001 | 97.239 |
| 1.0 | 97.305 |
| 0.999 | 97.28 |
| 0.998 | 97.221 |
| 0.997 | 97.086 |
| 0.996 | 96.894 |
| 0.995 | 96.666 |
| 0.994 | 96.368 |
| 0.993 | 96.008 |
| 0.992 | 95.603 |
| 0.991 | 95.162 |
| 0.99 | 94.683 |
| 0.989 | 94.143 |
| 0.988 | 93.577 |
| 0.987 | 92.93 |
| 0.986 | 92.258 |
| 0.985 | 91.582 |
| 0.984 | 90.864 |
| 0.983 | 90.089 |
| 0.982 | 89.331 |
| 0.981 | 88.507 |
| 0.98 | 87.674 |
| 0.979 | 86.855 |
| 0.978 | 86.002 |
| 0.977 | 85.13 |
| 0.976 | 84.275 |
| 0.975 | 83.364 |
| 0.974 | 82.466 |
| 0.973 | 81.575 |
| 0.972 | 80.662 |
| 0.971 | 79.759 |
| 0.97 | 78.814 |
| 0.969 | 77.913 |
| 0.968 | 76.948 |
| 0.967 | 75.999 |
| 0.966 | 75.147 |
| 0.965 | 74.245 |
| 0.964 | 73.363 |
| 0.963 | 72.49 |
| 0.962 | 71.577 |
| 0.961 | 70.676 |
| 0.96 | 69.814 |
| 0.959 | 68.966 |
| 0.958 | 68.106 |
| 0.957 | 67.271 |
| 0.956 | 66.422 |
| 0.955 | 65.575 |
| 0.954 | 64.768 |
| 0.953 | 63.981 |
| 0.952 | 63.215 |
| 0.951 | 62.428 |
| 0.95 | 61.701 |
| 0.949 | 60.914 |
| 0.948 | 60.14 |
| 0.947 | 59.436 |
| 0.946 | 58.728 |
| 0.945 | 58.005 |
| 0.944 | 57.32 |
| 0.943 | 56.604 |
| 0.942 | 55.89 |
| 0.941 | 55.227 |
| 0.94 | 54.572 |
| 0.939 | 53.908 |
| 0.938 | 53.261 |
| 0.937 | 52.605 |
| 0.936 | 51.94 |
| 0.935 | 51.297 |
| 0.934 | 50.696 |
| 0.933 | 50.09 |
| 0.932 | 49.481 |
| 0.931 | 48.9 |
| 0.93 | 48.276 |
| 0.929 | 47.648 |
| 0.928 | 47.086 |
| 0.927 | 46.5 |
| 0.926 | 45.923 |
| 0.925 | 45.369 |
| 0.924 | 44.792 |
| 0.923 | 44.205 |
| 0.922 | 43.64 |
| 0.921 | 43.103 |
| 0.92 | 42.551 |
| 0.919 | 42.02 |
| 0.918 | 41.485 |
| 0.917 | 40.94 |
| 0.916 | 40.39 |
| 0.915 | 39.881 |
| 0.914 | 39.366 |
| 0.913 | 38.837 |
| 0.912 | 38.35 |
| 0.911 | 37.826 |
| 0.91 | 37.307 |
| 0.909 | 36.836 |
| 0.908 | 36.339 |
| 0.907 | 35.858 |
| 0.906 | 35.386 |
| 0.905 | 34.907 |
| 0.904 | 34.433 |
| 0.903 | 33.976 |
| 0.902 | 33.538 |
| 0.901 | 33.083 |
| 0.9 | 32.651 |
| 0.899 | 32.2 |
| 0.898 | 31.754 |
| 0.897 | 31.324 |
| 0.896 | 30.913 |
| 0.895 | 30.513 |
| 0.894 | 30.099 |
| 0.893 | 29.722 |
| 0.892 | 29.314 |
| 0.891 | 28.916 |
| 0.89 | 28.56 |
| 0.889 | 28.19 |
| 0.888 | 27.834 |
| 0.887 | 27.497 |
| 0.886 | 27.152 |
| 0.885 | 26.803 |
| 0.884 | 26.472 |
| 0.883 | 26.156 |
| 0.882 | 25.834 |
| 0.881 | 25.533 |
| 0.88 | 25.238 |
| 0.879 | 24.946 |
| 0.878 | 24.665 |
| 0.877 | 24.404 |
| 0.876 | 24.151 |
| 0.875 | 23.894 |
| 0.874 | 23.663 |
| 0.873 | 23.416 |
| 0.872 | 23.177 |
| 0.871 | 22.972 |
| 0.87 | 22.76 |
| 0.869 | 22.566 |
| 0.868 | 22.379 |
| 0.867 | 22.195 |
| 0.866 | 22.017 |
| 0.865 | 21.852 |
| 0.864 | 21.705 |
| 0.863 | 21.555 |
| 0.862 | 21.424 |
| 0.861 | 21.295 |
| 0.86 | 21.172 |
| 0.859 | 21.05 |
| 0.858 | 20.954 |
| 0.857 | 20.862 |
| 0.856 | 20.772 |
| 0.855 | 20.706 |
| 0.854 | 20.637 |
| 0.853 | 20.577 |
| 0.852 | 20.532 |
| 0.851 | 20.493 |
| 0.85 | 20.467 |
| 0.849 | 20.447 |
| 0.848 | 20.434 |
| 0.847 | 20.433 |
| 0.846 | 20.445 |
| 0.845 | 20.458 |
| 0.844 | 20.486 |
| 0.843 | 20.525 |
| 0.842 | 20.568 |
| 0.841 | 20.629 |
| 0.84 | 20.697 |
| 0.839 | 20.771 |
| 0.838 | 20.863 |
| 0.837 | 20.961 |
| 0.836 | 21.063 |
| 0.835 | 21.182 |
| 0.834 | 21.328 |
| 0.833 | 21.458 |
| 0.832 | 21.605 |
| 0.831 | 21.767 |
| 0.83 | 21.944 |
| 0.829 | 22.127 |
| 0.828 | 22.321 |
| 0.827 | 22.531 |
| 0.826 | 22.742 |
| 0.825 | 22.983 |
| 0.824 | 23.218 |
| 0.823 | 23.469 |
| 0.822 | 23.746 |
| 0.821 | 24.027 |
| 0.82 | 24.309 |
| 0.819 | 24.601 |
| 0.818 | 24.918 |
| 0.817 | 25.228 |
| 0.816 | 25.569 |
| 0.815 | 25.928 |
| 0.814 | 26.27 |
| 0.813 | 26.638 |
| 0.812 | 27.016 |
| 0.811 | 27.396 |
| 0.81 | 27.799 |
| 0.809 | 28.21 |
| 0.808 | 28.613 |
| 0.807 | 29.019 |
| 0.806 | 29.44 |
| 0.805 | 29.87 |
| 0.804 | 30.295 |
| 0.803 | 30.754 |
| 0.802 | 31.198 |
| 0.801 | 31.633 |
| 0.8 | 32.078 |
| 0.799 | 32.485 |
| 0.798 | 32.941 |
| 0.797 | 33.376 |
| 0.796 | 33.817 |
| 0.795 | 34.265 |
| 0.794 | 34.687 |
| 0.793 | 35.102 |
| 0.792 | 35.521 |
| 0.791 | 35.926 |
| 0.79 | 36.334 |
| 0.789 | 36.71 |
| 0.788 | 37.086 |
| 0.787 | 37.458 |
| 0.786 | 37.788 |
| 0.785 | 38.126 |
| 0.784 | 38.44 |
| 0.783 | 38.768 |
| 0.782 | 39.046 |
| 0.781 | 39.328 |
| 0.78 | 39.626 |
| 0.779 | 39.867 |
| 0.778 | 40.121 |
| 0.777 | 40.374 |
| 0.776 | 40.61 |
| 0.775 | 40.838 |
| 0.774 | 41.076 |
| 0.773 | 41.289 |
| 0.772 | 41.508 |
| 0.771 | 41.738 |
| 0.77 | 41.96 |
| 0.769 | 42.185 |
| 0.768 | 42.412 |
| 0.767 | 42.655 |
| 0.766 | 42.894 |
| 0.765 | 43.152 |
| 0.764 | 43.436 |
| 0.763 | 43.717 |
| 0.762 | 44.025 |
| 0.761 | 44.337 |
| 0.76 | 44.692 |
| 0.759 | 45.051 |
| 0.758 | 45.451 |
| 0.757 | 45.864 |
| 0.756 | 46.316 |
| 0.755 | 46.801 |
| 0.754 | 47.303 |
| 0.753 | 47.84 |
| 0.752 | 48.415 |
| 0.751 | 49.016 |
| 0.75 | 49.654 |
| 0.749 | 50.327 |
| 0.748 | 51.033 |
| 0.747 | 51.768 |
| 0.746 | 52.558 |
| 0.745 | 53.359 |
| 0.744 | 54.211 |
| 0.743 | 55.07 |
| 0.742 | 55.976 |
| 0.741 | 56.892 |
| 0.74 | 57.813 |
| 0.739 | 58.769 |
| 0.738 | 59.726 |
| 0.737 | 60.694 |
| 0.736 | 61.648 |
| 0.735 | 62.576 |
| 0.734 | 63.49 |
| 0.733 | 64.356 |
| 0.732 | 65.187 |
| 0.731 | 65.958 |
| 0.73 | 66.637 |
| 0.729 | 67.267 |
| 0.728 | 67.757 |
| 0.727 | 68.191 |
| 0.726 | 68.478 |
| 0.725 | 68.66 |
| 0.724 | 68.723 |
| 0.723 | 68.628 |
| 0.722 | 68.426 |
| 0.721 | 68.083 |
| 0.72 | 67.632 |
| 0.719 | 67.05 |
| 0.718 | 66.344 |
| 0.717 | 65.567 |
| 0.716 | 64.661 |
| 0.715 | 63.689 |
| 0.714 | 62.651 |
| 0.713 | 61.544 |
| 0.712 | 60.42 |
| 0.711 | 59.235 |
| 0.71 | 58.046 |
| 0.709 | 56.869 |
| 0.708 | 55.673 |
| 0.707 | 54.511 |
| 0.706 | 53.356 |
| 0.705 | 52.253 |
| 0.704 | 51.186 |
| 0.703 | 50.159 |
| 0.702 | 49.183 |
| 0.701 | 48.263 |
| 0.7 | 47.401 |
| 0.699 | 46.622 |
| 0.698 | 45.872 |
| 0.697 | 45.204 |
| 0.696 | 44.602 |
| 0.695 | 44.062 |
| 0.694 | 43.587 |
| 0.693 | 43.169 |
| 0.692 | 42.831 |
| 0.691 | 42.562 |
| 0.69 | 42.357 |
| 0.689 | 42.235 |
| 0.688 | 42.175 |
| 0.687 | 42.193 |
| 0.686 | 42.29 |
| 0.685 | 42.455 |
| 0.684 | 42.706 |
| 0.683 | 43.032 |
| 0.682 | 43.445 |
| 0.681 | 43.935 |
| 0.68 | 44.526 |
| 0.679 | 45.193 |
| 0.678 | 45.962 |
| 0.677 | 46.829 |
| 0.676 | 47.79 |
| 0.675 | 48.847 |
| 0.674 | 50.009 |
| 0.673 | 51.249 |
| 0.672 | 52.634 |
| 0.671 | 54.111 |
| 0.67 | 55.705 |
| 0.669 | 57.389 |
| 0.668 | 59.166 |
| 0.667 | 61.104 |
| 0.666 | 63.056 |
| 0.665 | 65.12 |
| 0.664 | 67.26 |
| 0.663 | 69.449 |
| 0.662 | 71.68 |
| 0.661 | 73.904 |
| 0.66 | 76.098 |
| 0.659 | 78.277 |
| 0.658 | 80.378 |
| 0.657 | 82.368 |
| 0.656 | 84.232 |
| 0.655 | 85.941 |
| 0.654 | 87.494 |
| 0.653 | 88.823 |
| 0.652 | 89.946 |
| 0.651 | 90.866 |
| 0.65 | 91.534 |
| 0.649 | 91.978 |
| 0.648 | 92.225 |
| 0.647 | 92.261 |
| 0.646 | 92.105 |
| 0.645 | 91.787 |
| 0.644 | 91.329 |
| 0.643 | 90.761 |
| 0.642 | 90.064 |
| 0.641 | 89.317 |
| 0.64 | 88.484 |
| 0.639 | 87.638 |
| 0.638 | 86.718 |
| 0.637 | 85.795 |
| 0.636 | 84.814 |
| 0.635 | 83.795 |
| 0.634 | 82.725 |
| 0.633 | 81.583 |
| 0.632 | 80.354 |
| 0.631 | 79.037 |
| 0.63 | 77.562 |
| 0.629 | 76.015 |
| 0.628 | 74.205 |
| 0.627 | 72.282 |
| 0.626 | 70.165 |
| 0.625 | 67.849 |
| 0.624 | 65.404 |
| 0.623 | 62.726 |
| 0.622 | 59.934 |
| 0.621 | 57.058 |
| 0.62 | 54.045 |
| 0.619 | 51.029 |
| 0.618 | 48.008 |
| 0.617 | 45.016 |
| 0.616 | 42.158 |
| 0.615 | 39.293 |
| 0.614 | 36.631 |
| 0.613 | 34.105 |
| 0.612 | 31.705 |
| 0.611 | 29.48 |
| 0.61 | 27.392 |
| 0.609 | 25.472 |
| 0.608 | 23.73 |
| 0.607 | 22.102 |
| 0.606 | 20.63 |
| 0.605 | 19.292 |
| 0.604 | 18.075 |
| 0.603 | 16.989 |
| 0.602 | 15.975 |
| 0.601 | 15.09 |
| 0.6 | 14.287 |
| 0.599 | 13.567 |
| 0.598 | 12.922 |
| 0.597 | 12.345 |
| 0.596 | 11.847 |
| 0.595 | 11.404 |
| 0.594 | 11.019 |
| 0.593 | 10.691 |
| 0.592 | 10.408 |
| 0.591 | 10.182 |
| 0.59 | 10.005 |
| 0.589 | 9.863 |
| 0.588 | 9.774 |
| 0.587 | 9.734 |
| 0.586 | 9.734 |
| 0.585 | 9.792 |
| 0.584 | 9.89 |
| 0.583 | 10.054 |
| 0.582 | 10.265 |
| 0.581 | 10.557 |
| 0.58 | 10.915 |
| 0.579 | 11.37 |
| 0.578 | 11.906 |
| 0.577 | 12.565 |
| 0.576 | 13.365 |
| 0.575 | 14.308 |
| 0.574 | 15.452 |
| 0.573 | 16.834 |
| 0.572 | 18.475 |
| 0.571 | 20.464 |
| 0.57 | 22.882 |
| 0.569 | 25.7 |
| 0.568 | 29.247 |
| 0.567 | 33.257 |
| 0.566 | 37.797 |
| 0.565 | 42.727 |
| 0.564 | 47.577 |
| 0.563 | 52.09 |
| 0.562 | 55.393 |
| 0.561 | 57.076 |
| 0.56 | 56.808 |
| 0.559 | 54.595 |
| 0.558 | 50.754 |
| 0.557 | 45.797 |
| 0.556 | 40.484 |
| 0.555 | 35.112 |
| 0.554 | 30.295 |
| 0.553 | 26.04 |
| 0.552 | 22.412 |
| 0.551 | 19.431 |
| 0.55 | 16.928 |
| 0.549 | 14.89 |
| 0.548 | 13.217 |
| 0.547 | 11.816 |
| 0.546 | 10.657 |
| 0.545 | 9.712 |
| 0.544 | 8.9 |
| 0.543 | 8.243 |
| 0.542 | 7.691 |
| 0.541 | 7.233 |
| 0.54 | 6.848 |
| 0.539 | 6.545 |
| 0.538 | 6.288 |
| 0.537 | 6.076 |
| 0.536 | 5.934 |
| 0.535 | 5.823 |
| 0.534 | 5.757 |
| 0.533 | 5.733 |
| 0.532 | 5.745 |
| 0.531 | 5.793 |
| 0.53 | 5.876 |
| 0.529 | 6.008 |
| 0.528 | 6.177 |
| 0.527 | 6.391 |
| 0.526 | 6.64 |
| 0.525 | 6.957 |
| 0.524 | 7.332 |
| 0.523 | 7.744 |
| 0.522 | 8.226 |
| 0.521 | 8.793 |
| 0.52 | 9.422 |
| 0.519 | 10.133 |
| 0.518 | 10.928 |
| 0.517 | 11.791 |
| 0.516 | 12.74 |
| 0.515 | 13.738 |
| 0.514 | 14.791 |
| 0.513 | 15.889 |
| 0.512 | 16.976 |
| 0.511 | 18.037 |
| 0.51 | 19.021 |
| 0.509 | 19.904 |
| 0.508 | 20.651 |
| 0.507 | 21.215 |
| 0.506 | 21.601 |
| 0.505 | 21.786 |
| 0.504 | 21.795 |
| 0.503 | 21.639 |
| 0.502 | 21.335 |
| 0.501 | 20.942 |
| 0.5 | 20.462 |
| 0.499 | 19.947 |
| 0.498 | 19.445 |
| 0.497 | 18.944 |
| 0.496 | 18.503 |
| 0.495 | 18.098 |
| 0.494 | 17.779 |
| 0.493 | 17.525 |
| 0.492 | 17.338 |
| 0.491 | 17.187 |
| 0.49 | 17.038 |
| 0.489 | 16.86 |
| 0.488 | 16.589 |
| 0.487 | 16.127 |
| 0.486 | 15.431 |
| 0.485 | 14.457 |
| 0.484 | 13.186 |
| 0.483 | 11.682 |
| 0.482 | 9.991 |
| 0.481 | 8.302 |
| 0.48 | 6.709 |
| 0.479 | 5.253 |
| 0.478 | 4.034 |
| 0.477 | 3.057 |
| 0.476 | 2.281 |
| 0.475 | 1.728 |
| 0.474 | 1.289 |
| 0.473 | 0.974 |
| 0.472 | 0.742 |
| 0.471 | 0.579 |
| 0.47 | 0.443 |
| 0.469 | 0.361 |
| 0.468 | 0.287 |
| 0.467 | 0.241 |
| 0.466 | 0.197 |
| 0.465 | 0.167 |
| 0.464 | 0.145 |
| 0.463 | 0.129 |
| 0.462 | 0.115 |
| 0.461 | 0.096 |
| 0.46 | 0.081 |
| 0.459 | 0.069 |
| 0.458 | 0.059 |
| 0.457 | 0.049 |
| 0.456 | 0.053 |
| 0.455 | 0.036 |
| 0.454 | 0.036 |
| 0.453 | 0.025 |
| 0.452 | 0.024 |
| 0.451 | 0.019 |
| 0.45 | 0.027 |
| 0.449 | 0.029 |
| 0.448 | 0.022 |
| 0.447 | 0.021 |
| 0.446 | 0.016 |
| 0.445 | 0.012 |
| 0.444 | 0.007 |
| 0.443 | 0.02 |
| 0.442 | 0.008 |
| 0.441 | 0.005 |
| 0.44 | 0.016 |
| 0.439 | 0.014 |
| 0.438 | 0.006 |
| 0.437 | 0.012 |
| 0.436 | 0.008 |
| 0.435 | 0.001 |
| 0.434 | 0.02 |
| 0.433 | 0.016 |
| 0.432 | 0.015 |
| 0.431 | 0.004 |
| 0.43 | 0.002 |
| 0.429 | 0.016 |
| 0.428 | 0.031 |
| 0.427 | 0.022 |
| 0.426 | 0.016 |
| 0.425 | 0.004 |
| 0.424 | 0.021 |
| 0.423 | 0.002 |
| 0.422 | 0.011 |
| 0.421 | 0.03 |
| 0.42 | 0.011 |
| 0.419 | 0 |
| 0.418 | 0.015 |
| 0.417 | 0.022 |
| 0.416 | 0.012 |
| 0.415 | 0.016 |
| 0.414 | 0.011 |
| 0.413 | 0.009 |
| 0.412 | 0.024 |
| 0.411 | 0.021 |
| 0.41 | 0.027 |
| 0.409 | 0.016 |
| 0.408 | 0.018 |
| 0.407 | 0.015 |
| 0.406 | 0.005 |
| 0.405 | 0.046 |
| 0.404 | 0.033 |
| 0.403 | 0.016 |
| 0.402 | 0.027 |
| 0.401 | 0.004 |
| 0.4 | 0.011 |
| 0.399 | 0 |
| 0.398 | 0.031 |
| 0.397 | 0.024 |
| 0.396 | 0.004 |
| 0.395 | 0.039 |
| 0.394 | 0.003 |
| 0.393 | 0.021 |
| 0.392 | 0.026 |
| 0.391 | 0.065 |
| 0.39 | 0.033 |
| 0.389 | 0.06 |
| 0.388 | 0.062 |
| 0.387 | 0.01 |
| 0.386 | 0.051 |
| 0.385 | 0.023 |
| 0.384 | 0.045 |
| 0.383 | 0.007 |
| 0.382 | 0.095 |
| 0.381 | 0.031 |
| 0.38 | 0.01 |
| 0.379 | 0.018 |
| 0.378 | 0.046 |
| 0.377 | 0.071 |
| 0.376 | 0.038 |
| 0.375 | 0.061 |
| 0.374 | 0.047 |
| 0.373 | 0.07 |
| 0.372 | 0.085 |
| 0.371 | 0.027 |
| 0.37 | 0.047 |
| 0.369 | 0.069 |
| 0.368 | 0.027 |
| 0.367 | 0.079 |
| 0.366 | 0.067 |
| 0.365 | 0.022 |
| 0.364 | 0.025 |
| 0.363 | 0.021 |
| 0.362 | 0.036 |
| 0.361 | 0.007 |
| 0.36 | 0.091 |
| 0.359 | 0.078 |
| 0.358 | 0.104 |
| 0.357 | 0.041 |
| 0.356 | 0.041 |
| 0.355 | 0.003 |
| 0.354 | 0.028 |
| 0.353 | 0.129 |
| 0.352 | 0.039 |
| 0.351 | 0.03 |
| 0.35 | 0.191 |
| 0.349 | 0.057 |
| 0.348 | 0.09 |
| 0.347 | 0.07 |
| 0.346 | 0.159 |
| 0.345 | 0.222 |
| 0.344 | 0.018 |
| 0.343 | 0.138 |
| 0.342 | 0.048 |
| 0.341 | 0.105 |
| 0.34 | 0.009 |
| 0.339 | 0.036 |
| 0.338 | 0.328 |
| 0.337 | 0.004 |
| 0.336 | 0.062 |
| 0.335 | 0.268 |
| 0.334 | 0.11 |
| 0.333 | 0.002 |
| 0.332 | 0.078 |
| 0.331 | 0.039 |
| 0.33 | 0.103 |
| 0.329 | 0.208 |
| 0.328 | 0.258 |
| 0.327 | 0.077 |
| 0.326 | 0.024 |
| 0.325 | 0.22 |
| 0.324 | 0.412 |
| 0.323 | 0.08 |
| 0.322 | 0.004 |
| 0.321 | 0.011 |
| 0.32 | 0.098 |
| 0.319 | 0.108 |
| 0.318 | 0.048 |
| 0.317 | 0.01 |
| 0.316 | 0.049 |
| 0.315 | 0.27 |
| 0.314 | 0.009 |
| 0.313 | 0.235 |
| 0.312 | 0.036 |
| 0.311 | 0.29 |
| 0.31 | 0.191 |
| 0.309 | 0.191 |
| 0.308 | 0.036 |
| 0.307 | 0.164 |
| 0.306 | 0.196 |
| 0.305 | 0.001 |
| 0.304 | 0.084 |
| 0.303 | 0.038 |
| 0.302 | 0.046 |
| 0.301 | 0.164 |
| 0.3 | 0.091 |
| 0.299 | 0.28 |
| 0.298 | 0.028 |
| 0.297 | 0.014 |
| 0.296 | 0.094 |
| 0.295 | 0.077 |
| 0.294 | 0.096 |
| 0.293 | 0.064 |
| 0.292 | 0.039 |
| 0.291 | 0.008 |
| 0.29 | 0.147 |
| 0.289 | 0.027 |
| 0.288 | 0.097 |
| 0.287 | 0.05 |
| 0.286 | 0.06 |
| 0.285 | 0.072 |
| 0.284 | 0.155 |
| 0.283 | 0.093 |
| 0.282 | 0.076 |
| 0.281 | 0.118 |
| 0.28 | 0.02 |
| 0.279 | 0.071 |
| 0.278 | 0.148 |
| 0.277 | 0.138 |
| 0.276 | 0.162 |
| 0.275 | 0.012 |
| 0.274 | 0.026 |
| 0.273 | 0.055 |
| 0.272 | 0.119 |
| 0.271 | 0.063 |
| 0.27 | 0.041 |
| 0.269 | 0.046 |
| 0.268 | 0.057 |
| 0.267 | 0.088 |
| 0.266 | 0.029 |
| 0.265 | 0.092 |
| 0.264 | 0.027 |
| 0.263 | 0.037 |
| 0.262 | 0.045 |
| 0.261 | 0.056 |
| 0.26 | 0.054 |
| 0.259 | 0.005 |
| 0.258 | 0.006 |
| 0.257 | 0.012 |
| 0.256 | 0.005 |
| 0.255 | 0.08 |
| 0.254 | 0.034 |
| 0.253 | 0.022 |
| 0.252 | 0.05 |
| 0.251 | 0.03 |
| 0.25 | 0.01 |
| 0.249 | 0.009 |
| 0.248 | 0.017 |
| 0.247 | 0.018 |
| 0.246 | 0.018 |
| 0.245 | 0.002 |
| 0.244 | 0.008 |
| 0.243 | 0.003 |
| 0.242 | 0.039 |
| 0.241 | 0.035 |
| 0.24 | 0.016 |
| 0.239 | 0.006 |
| 0.238 | 0.016 |
| 0.237 | 0.006 |
| 0.236 | 0.027 |
| 0.235 | 0.023 |
| 0.234 | 0.024 |
| 0.233 | 0.024 |
| 0.232 | 0.008 |
| 0.231 | 0.04 |
| 0.23 | 0.017 |
| 0.229 | 0.033 |
| 0.228 | 0.017 |
| 0.227 | 0.039 |
| 0.226 | 0.044 |
| 0.225 | 0.002 |
| 0.224 | 0.013 |
| 0.223 | 0.076 |
| 0.222 | 0.014 |
| 0.221 | 0.004 |
| 0.22 | 0.009 |
| 0.219 | 0.077 |
| 0.218 | 0.028 |
| 0.217 | 0.059 |
| 0.216 | 0.057 |
| 0.215 | 0.167 |
| 0.214 | 0.026 |
| 0.213 | 0.014 |
| 0.212 | 0.095 |
| 0.211 | 0.224 |
| 0.21 | 0.082 |
| 0.209 | 0.062 |
| 0.208 | 0.006 |
| 0.207 | 0.018 |
| 0.206 | 0.006 |
| 0.205 | 0.061 |
| 0.204 | 0.18 |
| 0.203 | 0.3 |
| 0.202 | 0.228 |
| 0.201 | 0.388 |
| 0.2 | 0.332 |